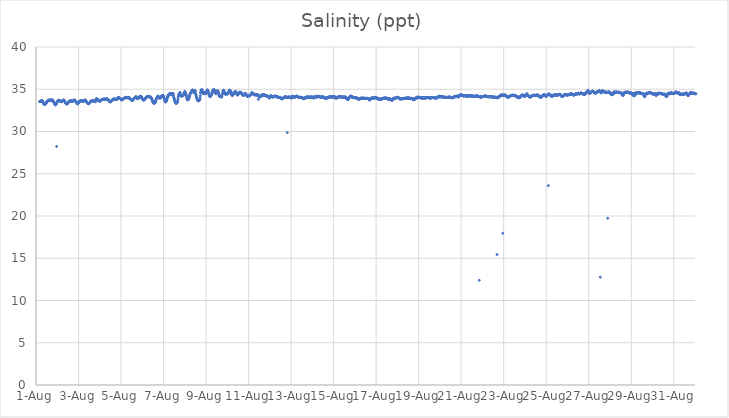
| Category | Salinity (ppt) |
|---|---|
| 44774.166666666664 | 33.56 |
| 44774.177083333336 | 33.54 |
| 44774.1875 | 33.53 |
| 44774.197916666664 | 33.58 |
| 44774.208333333336 | 33.58 |
| 44774.21875 | 33.6 |
| 44774.229166666664 | 33.6 |
| 44774.239583333336 | 33.61 |
| 44774.25 | 33.61 |
| 44774.260416666664 | 33.63 |
| 44774.270833333336 | 33.64 |
| 44774.28125 | 33.62 |
| 44774.291666666664 | 33.61 |
| 44774.302083333336 | 33.6 |
| 44774.3125 | 33.56 |
| 44774.322916666664 | 33.49 |
| 44774.333333333336 | 33.43 |
| 44774.34375 | 33.39 |
| 44774.354166666664 | 33.34 |
| 44774.364583333336 | 33.29 |
| 44774.375 | 33.25 |
| 44774.385416666664 | 33.23 |
| 44774.395833333336 | 33.2 |
| 44774.40625 | 33.2 |
| 44774.416666666664 | 33.21 |
| 44774.427083333336 | 33.26 |
| 44774.4375 | 33.27 |
| 44774.447916666664 | 33.28 |
| 44774.458333333336 | 33.3 |
| 44774.46875 | 33.33 |
| 44774.479166666664 | 33.37 |
| 44774.489583333336 | 33.42 |
| 44774.5 | 33.48 |
| 44774.510416666664 | 33.54 |
| 44774.520833333336 | 33.57 |
| 44774.53125 | 33.59 |
| 44774.541666666664 | 33.59 |
| 44774.552083333336 | 33.6 |
| 44774.5625 | 33.61 |
| 44774.572916666664 | 33.63 |
| 44774.583333333336 | 33.65 |
| 44774.59375 | 33.68 |
| 44774.604166666664 | 33.69 |
| 44774.614583333336 | 33.71 |
| 44774.625 | 33.73 |
| 44774.635416666664 | 33.73 |
| 44774.645833333336 | 33.74 |
| 44774.65625 | 33.72 |
| 44774.666666666664 | 33.71 |
| 44774.677083333336 | 33.64 |
| 44774.6875 | 33.68 |
| 44774.697916666664 | 33.67 |
| 44774.708333333336 | 33.68 |
| 44774.71875 | 33.67 |
| 44774.729166666664 | 33.72 |
| 44774.739583333336 | 33.71 |
| 44774.75 | 33.69 |
| 44774.760416666664 | 33.74 |
| 44774.770833333336 | 33.75 |
| 44774.78125 | 33.69 |
| 44774.791666666664 | 33.6 |
| 44774.802083333336 | 33.63 |
| 44774.8125 | 33.6 |
| 44774.822916666664 | 33.52 |
| 44774.833333333336 | 33.48 |
| 44774.84375 | 33.42 |
| 44774.854166666664 | 33.38 |
| 44774.864583333336 | 33.35 |
| 44774.875 | 33.28 |
| 44774.885416666664 | 33.26 |
| 44774.895833333336 | 33.16 |
| 44774.90625 | 33.16 |
| 44774.916666666664 | 33.18 |
| 44774.927083333336 | 33.24 |
| 44774.9375 | 33.25 |
| 44774.947916666664 | 33.24 |
| 44774.958333333336 | 33.3 |
| 44774.96875 | 28.22 |
| 44774.979166666664 | 33.4 |
| 44774.989583333336 | 33.47 |
| 44775.0 | 33.54 |
| 44775.010416666664 | 33.56 |
| 44775.020833333336 | 33.59 |
| 44775.03125 | 33.61 |
| 44775.041666666664 | 33.66 |
| 44775.052083333336 | 33.69 |
| 44775.0625 | 33.69 |
| 44775.072916666664 | 33.69 |
| 44775.083333333336 | 33.69 |
| 44775.09375 | 33.68 |
| 44775.104166666664 | 33.66 |
| 44775.114583333336 | 33.64 |
| 44775.125 | 33.62 |
| 44775.135416666664 | 33.6 |
| 44775.145833333336 | 33.57 |
| 44775.15625 | 33.56 |
| 44775.166666666664 | 33.56 |
| 44775.177083333336 | 33.55 |
| 44775.1875 | 33.54 |
| 44775.197916666664 | 33.53 |
| 44775.208333333336 | 33.57 |
| 44775.21875 | 33.56 |
| 44775.229166666664 | 33.58 |
| 44775.239583333336 | 33.6 |
| 44775.25 | 33.64 |
| 44775.260416666664 | 33.69 |
| 44775.270833333336 | 33.68 |
| 44775.28125 | 33.7 |
| 44775.291666666664 | 33.73 |
| 44775.302083333336 | 33.74 |
| 44775.3125 | 33.69 |
| 44775.322916666664 | 33.69 |
| 44775.333333333336 | 33.65 |
| 44775.34375 | 33.62 |
| 44775.354166666664 | 33.56 |
| 44775.364583333336 | 33.5 |
| 44775.375 | 33.42 |
| 44775.385416666664 | 33.4 |
| 44775.395833333336 | 33.36 |
| 44775.40625 | 33.33 |
| 44775.416666666664 | 33.29 |
| 44775.427083333336 | 33.27 |
| 44775.4375 | 33.26 |
| 44775.447916666664 | 33.26 |
| 44775.458333333336 | 33.27 |
| 44775.46875 | 33.3 |
| 44775.479166666664 | 33.31 |
| 44775.489583333336 | 33.32 |
| 44775.5 | 33.35 |
| 44775.510416666664 | 33.41 |
| 44775.520833333336 | 33.46 |
| 44775.53125 | 33.52 |
| 44775.541666666664 | 33.54 |
| 44775.552083333336 | 33.56 |
| 44775.5625 | 33.57 |
| 44775.572916666664 | 33.58 |
| 44775.583333333336 | 33.59 |
| 44775.59375 | 33.6 |
| 44775.604166666664 | 33.61 |
| 44775.614583333336 | 33.61 |
| 44775.625 | 33.61 |
| 44775.635416666664 | 33.61 |
| 44775.645833333336 | 33.61 |
| 44775.65625 | 33.61 |
| 44775.666666666664 | 33.6 |
| 44775.677083333336 | 33.6 |
| 44775.6875 | 33.59 |
| 44775.697916666664 | 33.57 |
| 44775.708333333336 | 33.57 |
| 44775.71875 | 33.59 |
| 44775.729166666664 | 33.57 |
| 44775.739583333336 | 33.59 |
| 44775.75 | 33.64 |
| 44775.760416666664 | 33.61 |
| 44775.770833333336 | 33.66 |
| 44775.78125 | 33.69 |
| 44775.791666666664 | 33.69 |
| 44775.802083333336 | 33.7 |
| 44775.8125 | 33.75 |
| 44775.822916666664 | 33.71 |
| 44775.833333333336 | 33.7 |
| 44775.84375 | 33.64 |
| 44775.854166666664 | 33.59 |
| 44775.864583333336 | 33.54 |
| 44775.875 | 33.57 |
| 44775.885416666664 | 33.51 |
| 44775.895833333336 | 33.51 |
| 44775.90625 | 33.43 |
| 44775.916666666664 | 33.46 |
| 44775.927083333336 | 33.29 |
| 44775.9375 | 33.27 |
| 44775.947916666664 | 33.28 |
| 44775.958333333336 | 33.34 |
| 44775.96875 | 33.35 |
| 44775.979166666664 | 33.33 |
| 44775.989583333336 | 33.36 |
| 44776.0 | 33.42 |
| 44776.010416666664 | 33.44 |
| 44776.020833333336 | 33.49 |
| 44776.03125 | 33.52 |
| 44776.041666666664 | 33.55 |
| 44776.052083333336 | 33.57 |
| 44776.0625 | 33.59 |
| 44776.072916666664 | 33.6 |
| 44776.083333333336 | 33.61 |
| 44776.09375 | 33.63 |
| 44776.104166666664 | 33.64 |
| 44776.114583333336 | 33.64 |
| 44776.125 | 33.64 |
| 44776.135416666664 | 33.65 |
| 44776.145833333336 | 33.64 |
| 44776.15625 | 33.63 |
| 44776.166666666664 | 33.62 |
| 44776.177083333336 | 33.62 |
| 44776.1875 | 33.61 |
| 44776.197916666664 | 33.6 |
| 44776.208333333336 | 33.6 |
| 44776.21875 | 33.56 |
| 44776.229166666664 | 33.56 |
| 44776.239583333336 | 33.58 |
| 44776.25 | 33.61 |
| 44776.260416666664 | 33.62 |
| 44776.270833333336 | 33.64 |
| 44776.28125 | 33.7 |
| 44776.291666666664 | 33.68 |
| 44776.302083333336 | 33.68 |
| 44776.3125 | 33.72 |
| 44776.322916666664 | 33.71 |
| 44776.333333333336 | 33.68 |
| 44776.34375 | 33.64 |
| 44776.354166666664 | 33.58 |
| 44776.364583333336 | 33.55 |
| 44776.375 | 33.5 |
| 44776.385416666664 | 33.46 |
| 44776.395833333336 | 33.43 |
| 44776.40625 | 33.4 |
| 44776.416666666664 | 33.38 |
| 44776.427083333336 | 33.34 |
| 44776.4375 | 33.32 |
| 44776.447916666664 | 33.3 |
| 44776.458333333336 | 33.29 |
| 44776.46875 | 33.28 |
| 44776.479166666664 | 33.31 |
| 44776.489583333336 | 33.33 |
| 44776.5 | 33.32 |
| 44776.510416666664 | 33.34 |
| 44776.520833333336 | 33.37 |
| 44776.53125 | 33.4 |
| 44776.541666666664 | 33.45 |
| 44776.552083333336 | 33.51 |
| 44776.5625 | 33.55 |
| 44776.572916666664 | 33.56 |
| 44776.583333333336 | 33.57 |
| 44776.59375 | 33.59 |
| 44776.604166666664 | 33.6 |
| 44776.614583333336 | 33.61 |
| 44776.625 | 33.62 |
| 44776.635416666664 | 33.63 |
| 44776.645833333336 | 33.63 |
| 44776.65625 | 33.64 |
| 44776.666666666664 | 33.64 |
| 44776.677083333336 | 33.63 |
| 44776.6875 | 33.61 |
| 44776.697916666664 | 33.61 |
| 44776.708333333336 | 33.61 |
| 44776.71875 | 33.61 |
| 44776.729166666664 | 33.58 |
| 44776.739583333336 | 33.58 |
| 44776.75 | 33.62 |
| 44776.760416666664 | 33.66 |
| 44776.770833333336 | 33.64 |
| 44776.78125 | 33.67 |
| 44776.791666666664 | 33.6 |
| 44776.802083333336 | 33.52 |
| 44776.8125 | 33.68 |
| 44776.822916666664 | 33.7 |
| 44776.833333333336 | 33.85 |
| 44776.84375 | 33.89 |
| 44776.854166666664 | 33.89 |
| 44776.864583333336 | 33.82 |
| 44776.875 | 33.81 |
| 44776.885416666664 | 33.8 |
| 44776.895833333336 | 33.77 |
| 44776.90625 | 33.78 |
| 44776.916666666664 | 33.75 |
| 44776.927083333336 | 33.74 |
| 44776.9375 | 33.67 |
| 44776.947916666664 | 33.65 |
| 44776.958333333336 | 33.65 |
| 44776.96875 | 33.6 |
| 44776.979166666664 | 33.58 |
| 44776.989583333336 | 33.62 |
| 44777.0 | 33.62 |
| 44777.010416666664 | 33.62 |
| 44777.020833333336 | 33.61 |
| 44777.03125 | 33.63 |
| 44777.041666666664 | 33.67 |
| 44777.052083333336 | 33.7 |
| 44777.0625 | 33.73 |
| 44777.072916666664 | 33.74 |
| 44777.083333333336 | 33.75 |
| 44777.09375 | 33.76 |
| 44777.104166666664 | 33.77 |
| 44777.114583333336 | 33.78 |
| 44777.125 | 33.78 |
| 44777.135416666664 | 33.8 |
| 44777.145833333336 | 33.82 |
| 44777.15625 | 33.82 |
| 44777.166666666664 | 33.82 |
| 44777.177083333336 | 33.81 |
| 44777.1875 | 33.81 |
| 44777.197916666664 | 33.81 |
| 44777.208333333336 | 33.81 |
| 44777.21875 | 33.82 |
| 44777.229166666664 | 33.82 |
| 44777.239583333336 | 33.82 |
| 44777.25 | 33.83 |
| 44777.260416666664 | 33.77 |
| 44777.270833333336 | 33.81 |
| 44777.28125 | 33.82 |
| 44777.291666666664 | 33.82 |
| 44777.302083333336 | 33.84 |
| 44777.3125 | 33.84 |
| 44777.322916666664 | 33.87 |
| 44777.333333333336 | 33.86 |
| 44777.34375 | 33.85 |
| 44777.354166666664 | 33.86 |
| 44777.364583333336 | 33.79 |
| 44777.375 | 33.81 |
| 44777.385416666664 | 33.8 |
| 44777.395833333336 | 33.74 |
| 44777.40625 | 33.71 |
| 44777.416666666664 | 33.68 |
| 44777.427083333336 | 33.66 |
| 44777.4375 | 33.61 |
| 44777.447916666664 | 33.58 |
| 44777.458333333336 | 33.55 |
| 44777.46875 | 33.53 |
| 44777.479166666664 | 33.51 |
| 44777.489583333336 | 33.51 |
| 44777.5 | 33.52 |
| 44777.510416666664 | 33.54 |
| 44777.520833333336 | 33.54 |
| 44777.53125 | 33.55 |
| 44777.541666666664 | 33.58 |
| 44777.552083333336 | 33.61 |
| 44777.5625 | 33.65 |
| 44777.572916666664 | 33.7 |
| 44777.583333333336 | 33.74 |
| 44777.59375 | 33.76 |
| 44777.604166666664 | 33.77 |
| 44777.614583333336 | 33.78 |
| 44777.625 | 33.8 |
| 44777.635416666664 | 33.82 |
| 44777.645833333336 | 33.82 |
| 44777.65625 | 33.85 |
| 44777.666666666664 | 33.85 |
| 44777.677083333336 | 33.85 |
| 44777.6875 | 33.85 |
| 44777.697916666664 | 33.84 |
| 44777.708333333336 | 33.81 |
| 44777.71875 | 33.8 |
| 44777.729166666664 | 33.8 |
| 44777.739583333336 | 33.78 |
| 44777.75 | 33.78 |
| 44777.760416666664 | 33.78 |
| 44777.770833333336 | 33.79 |
| 44777.78125 | 33.77 |
| 44777.791666666664 | 33.79 |
| 44777.802083333336 | 33.83 |
| 44777.8125 | 33.86 |
| 44777.822916666664 | 33.85 |
| 44777.833333333336 | 33.95 |
| 44777.84375 | 33.92 |
| 44777.854166666664 | 33.93 |
| 44777.864583333336 | 34.02 |
| 44777.875 | 33.99 |
| 44777.885416666664 | 34.01 |
| 44777.895833333336 | 34.01 |
| 44777.90625 | 34.01 |
| 44777.916666666664 | 33.98 |
| 44777.927083333336 | 33.99 |
| 44777.9375 | 33.95 |
| 44777.947916666664 | 33.92 |
| 44777.958333333336 | 33.87 |
| 44777.96875 | 33.85 |
| 44777.979166666664 | 33.85 |
| 44777.989583333336 | 33.85 |
| 44778.0 | 33.83 |
| 44778.010416666664 | 33.78 |
| 44778.020833333336 | 33.75 |
| 44778.03125 | 33.74 |
| 44778.041666666664 | 33.76 |
| 44778.052083333336 | 33.8 |
| 44778.0625 | 33.8 |
| 44778.072916666664 | 33.82 |
| 44778.083333333336 | 33.83 |
| 44778.09375 | 33.84 |
| 44778.104166666664 | 33.87 |
| 44778.114583333336 | 33.88 |
| 44778.125 | 33.9 |
| 44778.135416666664 | 33.9 |
| 44778.145833333336 | 33.91 |
| 44778.15625 | 33.92 |
| 44778.166666666664 | 33.94 |
| 44778.177083333336 | 33.97 |
| 44778.1875 | 34 |
| 44778.197916666664 | 34.02 |
| 44778.208333333336 | 34.04 |
| 44778.21875 | 34.03 |
| 44778.229166666664 | 34.04 |
| 44778.239583333336 | 34.04 |
| 44778.25 | 34.01 |
| 44778.260416666664 | 34 |
| 44778.270833333336 | 34 |
| 44778.28125 | 34.01 |
| 44778.291666666664 | 34.02 |
| 44778.302083333336 | 34.01 |
| 44778.3125 | 34 |
| 44778.322916666664 | 34.02 |
| 44778.333333333336 | 34.01 |
| 44778.34375 | 34.01 |
| 44778.354166666664 | 34 |
| 44778.364583333336 | 34.02 |
| 44778.375 | 34 |
| 44778.385416666664 | 33.98 |
| 44778.395833333336 | 33.92 |
| 44778.40625 | 33.89 |
| 44778.416666666664 | 33.89 |
| 44778.427083333336 | 33.86 |
| 44778.4375 | 33.84 |
| 44778.447916666664 | 33.82 |
| 44778.458333333336 | 33.8 |
| 44778.46875 | 33.79 |
| 44778.479166666664 | 33.76 |
| 44778.489583333336 | 33.73 |
| 44778.5 | 33.69 |
| 44778.510416666664 | 33.68 |
| 44778.520833333336 | 33.66 |
| 44778.53125 | 33.67 |
| 44778.541666666664 | 33.7 |
| 44778.552083333336 | 33.72 |
| 44778.5625 | 33.73 |
| 44778.572916666664 | 33.76 |
| 44778.583333333336 | 33.79 |
| 44778.59375 | 33.84 |
| 44778.604166666664 | 33.87 |
| 44778.614583333336 | 33.92 |
| 44778.625 | 33.94 |
| 44778.635416666664 | 33.96 |
| 44778.645833333336 | 33.99 |
| 44778.65625 | 34.01 |
| 44778.666666666664 | 34.04 |
| 44778.677083333336 | 34.07 |
| 44778.6875 | 34.09 |
| 44778.697916666664 | 34.13 |
| 44778.708333333336 | 34.13 |
| 44778.71875 | 34.07 |
| 44778.729166666664 | 34.01 |
| 44778.739583333336 | 33.97 |
| 44778.75 | 33.92 |
| 44778.760416666664 | 33.91 |
| 44778.770833333336 | 33.9 |
| 44778.78125 | 33.91 |
| 44778.791666666664 | 33.9 |
| 44778.802083333336 | 33.92 |
| 44778.8125 | 33.94 |
| 44778.822916666664 | 33.94 |
| 44778.833333333336 | 33.95 |
| 44778.84375 | 34 |
| 44778.854166666664 | 34.01 |
| 44778.864583333336 | 34.1 |
| 44778.875 | 34.17 |
| 44778.885416666664 | 34.14 |
| 44778.895833333336 | 34.04 |
| 44778.90625 | 34.11 |
| 44778.916666666664 | 34.06 |
| 44778.927083333336 | 34.11 |
| 44778.9375 | 34.13 |
| 44778.947916666664 | 34.16 |
| 44778.958333333336 | 34.1 |
| 44778.96875 | 34.04 |
| 44778.979166666664 | 33.99 |
| 44778.989583333336 | 33.94 |
| 44779.0 | 33.87 |
| 44779.010416666664 | 33.83 |
| 44779.020833333336 | 33.79 |
| 44779.03125 | 33.78 |
| 44779.041666666664 | 33.75 |
| 44779.052083333336 | 33.73 |
| 44779.0625 | 33.7 |
| 44779.072916666664 | 33.75 |
| 44779.083333333336 | 33.78 |
| 44779.09375 | 33.75 |
| 44779.104166666664 | 33.78 |
| 44779.114583333336 | 33.79 |
| 44779.125 | 33.83 |
| 44779.135416666664 | 33.89 |
| 44779.145833333336 | 33.95 |
| 44779.15625 | 33.98 |
| 44779.166666666664 | 34 |
| 44779.177083333336 | 34.02 |
| 44779.1875 | 34.04 |
| 44779.197916666664 | 34.06 |
| 44779.208333333336 | 34.08 |
| 44779.21875 | 34.1 |
| 44779.229166666664 | 34.12 |
| 44779.239583333336 | 34.13 |
| 44779.25 | 34.12 |
| 44779.260416666664 | 34.13 |
| 44779.270833333336 | 34.13 |
| 44779.28125 | 34.14 |
| 44779.291666666664 | 34.15 |
| 44779.302083333336 | 34.14 |
| 44779.3125 | 34.13 |
| 44779.322916666664 | 34.07 |
| 44779.333333333336 | 34.1 |
| 44779.34375 | 34.09 |
| 44779.354166666664 | 34.09 |
| 44779.364583333336 | 34.1 |
| 44779.375 | 34.07 |
| 44779.385416666664 | 34.11 |
| 44779.395833333336 | 34.05 |
| 44779.40625 | 34.04 |
| 44779.416666666664 | 33.99 |
| 44779.427083333336 | 33.97 |
| 44779.4375 | 33.9 |
| 44779.447916666664 | 33.83 |
| 44779.458333333336 | 33.77 |
| 44779.46875 | 33.7 |
| 44779.479166666664 | 33.61 |
| 44779.489583333336 | 33.57 |
| 44779.5 | 33.5 |
| 44779.510416666664 | 33.46 |
| 44779.520833333336 | 33.4 |
| 44779.53125 | 33.37 |
| 44779.541666666664 | 33.36 |
| 44779.552083333336 | 33.35 |
| 44779.5625 | 33.35 |
| 44779.572916666664 | 33.38 |
| 44779.583333333336 | 33.41 |
| 44779.59375 | 33.38 |
| 44779.604166666664 | 33.41 |
| 44779.614583333336 | 33.46 |
| 44779.625 | 33.54 |
| 44779.635416666664 | 33.66 |
| 44779.645833333336 | 33.78 |
| 44779.65625 | 33.85 |
| 44779.666666666664 | 33.9 |
| 44779.677083333336 | 33.94 |
| 44779.6875 | 34 |
| 44779.697916666664 | 34.04 |
| 44779.708333333336 | 34.08 |
| 44779.71875 | 34.14 |
| 44779.729166666664 | 34.14 |
| 44779.739583333336 | 34.19 |
| 44779.75 | 34.19 |
| 44779.760416666664 | 34.13 |
| 44779.770833333336 | 34.06 |
| 44779.78125 | 34.02 |
| 44779.791666666664 | 33.99 |
| 44779.802083333336 | 33.97 |
| 44779.8125 | 33.96 |
| 44779.822916666664 | 33.98 |
| 44779.833333333336 | 33.99 |
| 44779.84375 | 33.98 |
| 44779.854166666664 | 33.99 |
| 44779.864583333336 | 33.98 |
| 44779.875 | 34.03 |
| 44779.885416666664 | 34.07 |
| 44779.895833333336 | 34.14 |
| 44779.90625 | 34.16 |
| 44779.916666666664 | 34.21 |
| 44779.927083333336 | 34.24 |
| 44779.9375 | 34.2 |
| 44779.947916666664 | 34.17 |
| 44779.958333333336 | 34.24 |
| 44779.96875 | 34.26 |
| 44779.979166666664 | 34.26 |
| 44779.989583333336 | 34.23 |
| 44780.0 | 34.14 |
| 44780.010416666664 | 34.07 |
| 44780.020833333336 | 34 |
| 44780.03125 | 33.93 |
| 44780.041666666664 | 33.82 |
| 44780.052083333336 | 33.72 |
| 44780.0625 | 33.65 |
| 44780.072916666664 | 33.58 |
| 44780.083333333336 | 33.53 |
| 44780.09375 | 33.5 |
| 44780.104166666664 | 33.5 |
| 44780.114583333336 | 33.58 |
| 44780.125 | 33.6 |
| 44780.135416666664 | 33.6 |
| 44780.145833333336 | 33.67 |
| 44780.15625 | 33.76 |
| 44780.166666666664 | 33.9 |
| 44780.177083333336 | 33.98 |
| 44780.1875 | 34.07 |
| 44780.197916666664 | 34.14 |
| 44780.208333333336 | 34.19 |
| 44780.21875 | 34.23 |
| 44780.229166666664 | 34.27 |
| 44780.239583333336 | 34.32 |
| 44780.25 | 34.37 |
| 44780.260416666664 | 34.41 |
| 44780.270833333336 | 34.45 |
| 44780.28125 | 34.46 |
| 44780.291666666664 | 34.48 |
| 44780.302083333336 | 34.51 |
| 44780.3125 | 34.52 |
| 44780.322916666664 | 34.49 |
| 44780.333333333336 | 34.5 |
| 44780.34375 | 34.47 |
| 44780.354166666664 | 34.43 |
| 44780.364583333336 | 34.39 |
| 44780.375 | 34.37 |
| 44780.385416666664 | 34.35 |
| 44780.395833333336 | 34.35 |
| 44780.40625 | 34.46 |
| 44780.416666666664 | 34.45 |
| 44780.427083333336 | 34.39 |
| 44780.4375 | 34.44 |
| 44780.447916666664 | 34.48 |
| 44780.458333333336 | 34.47 |
| 44780.46875 | 34.23 |
| 44780.479166666664 | 34.06 |
| 44780.489583333336 | 33.98 |
| 44780.5 | 33.88 |
| 44780.510416666664 | 33.78 |
| 44780.520833333336 | 33.72 |
| 44780.53125 | 33.6 |
| 44780.541666666664 | 33.54 |
| 44780.552083333336 | 33.44 |
| 44780.5625 | 33.38 |
| 44780.572916666664 | 33.35 |
| 44780.583333333336 | 33.35 |
| 44780.59375 | 33.36 |
| 44780.604166666664 | 33.36 |
| 44780.614583333336 | 33.36 |
| 44780.625 | 33.43 |
| 44780.635416666664 | 33.39 |
| 44780.645833333336 | 33.43 |
| 44780.65625 | 33.51 |
| 44780.666666666664 | 33.64 |
| 44780.677083333336 | 33.84 |
| 44780.6875 | 34.07 |
| 44780.697916666664 | 34.19 |
| 44780.708333333336 | 34.3 |
| 44780.71875 | 34.36 |
| 44780.729166666664 | 34.44 |
| 44780.739583333336 | 34.53 |
| 44780.75 | 34.54 |
| 44780.760416666664 | 34.56 |
| 44780.770833333336 | 34.6 |
| 44780.78125 | 34.59 |
| 44780.791666666664 | 34.43 |
| 44780.802083333336 | 34.33 |
| 44780.8125 | 34.27 |
| 44780.822916666664 | 34.24 |
| 44780.833333333336 | 34.19 |
| 44780.84375 | 34.19 |
| 44780.854166666664 | 34.19 |
| 44780.864583333336 | 34.22 |
| 44780.875 | 34.24 |
| 44780.885416666664 | 34.25 |
| 44780.895833333336 | 34.26 |
| 44780.90625 | 34.24 |
| 44780.916666666664 | 34.23 |
| 44780.927083333336 | 34.28 |
| 44780.9375 | 34.31 |
| 44780.947916666664 | 34.36 |
| 44780.958333333336 | 34.49 |
| 44780.96875 | 34.56 |
| 44780.979166666664 | 34.63 |
| 44780.989583333336 | 34.68 |
| 44781.0 | 34.74 |
| 44781.010416666664 | 34.68 |
| 44781.020833333336 | 34.63 |
| 44781.03125 | 34.58 |
| 44781.041666666664 | 34.5 |
| 44781.052083333336 | 34.4 |
| 44781.0625 | 34.33 |
| 44781.072916666664 | 34.26 |
| 44781.083333333336 | 34.09 |
| 44781.09375 | 33.98 |
| 44781.104166666664 | 33.88 |
| 44781.114583333336 | 33.82 |
| 44781.125 | 33.77 |
| 44781.135416666664 | 33.74 |
| 44781.145833333336 | 33.74 |
| 44781.15625 | 33.78 |
| 44781.166666666664 | 33.85 |
| 44781.177083333336 | 33.83 |
| 44781.1875 | 33.87 |
| 44781.197916666664 | 33.96 |
| 44781.208333333336 | 34.07 |
| 44781.21875 | 34.17 |
| 44781.229166666664 | 34.28 |
| 44781.239583333336 | 34.39 |
| 44781.25 | 34.46 |
| 44781.260416666664 | 34.51 |
| 44781.270833333336 | 34.54 |
| 44781.28125 | 34.59 |
| 44781.291666666664 | 34.63 |
| 44781.302083333336 | 34.67 |
| 44781.3125 | 34.72 |
| 44781.322916666664 | 34.75 |
| 44781.333333333336 | 34.81 |
| 44781.34375 | 34.88 |
| 44781.354166666664 | 34.92 |
| 44781.364583333336 | 34.9 |
| 44781.375 | 34.83 |
| 44781.385416666664 | 34.82 |
| 44781.395833333336 | 34.73 |
| 44781.40625 | 34.61 |
| 44781.416666666664 | 34.69 |
| 44781.427083333336 | 34.63 |
| 44781.4375 | 34.71 |
| 44781.447916666664 | 34.76 |
| 44781.458333333336 | 34.81 |
| 44781.46875 | 34.79 |
| 44781.479166666664 | 34.71 |
| 44781.489583333336 | 34.85 |
| 44781.5 | 34.71 |
| 44781.510416666664 | 34.46 |
| 44781.520833333336 | 34.34 |
| 44781.53125 | 34.29 |
| 44781.541666666664 | 34.13 |
| 44781.55210648148 | 34.03 |
| 44781.5625 | 33.94 |
| 44781.572916666664 | 33.87 |
| 44781.583333333336 | 33.81 |
| 44781.59375 | 33.75 |
| 44781.604166666664 | 33.69 |
| 44781.614583333336 | 33.64 |
| 44781.625 | 33.64 |
| 44781.635416666664 | 33.64 |
| 44781.645833333336 | 33.63 |
| 44781.65625 | 33.66 |
| 44781.666666666664 | 33.68 |
| 44781.677083333336 | 33.71 |
| 44781.6875 | 33.69 |
| 44781.697916666664 | 33.75 |
| 44781.708333333336 | 33.81 |
| 44781.71875 | 34 |
| 44781.729166666664 | 34.23 |
| 44781.739583333336 | 34.56 |
| 44781.75 | 34.66 |
| 44781.760416666664 | 34.78 |
| 44781.770833333336 | 34.87 |
| 44781.78125 | 34.92 |
| 44781.791666666664 | 34.97 |
| 44781.802083333336 | 34.95 |
| 44781.8125 | 34.89 |
| 44781.822916666664 | 34.83 |
| 44781.833333333336 | 34.68 |
| 44781.84375 | 34.53 |
| 44781.854166666664 | 34.47 |
| 44781.864583333336 | 34.49 |
| 44781.875 | 34.5 |
| 44781.885416666664 | 34.55 |
| 44781.895833333336 | 34.58 |
| 44781.90625 | 34.61 |
| 44781.916666666664 | 34.61 |
| 44781.927083333336 | 34.6 |
| 44781.9375 | 34.59 |
| 44781.947916666664 | 34.55 |
| 44781.958333333336 | 34.53 |
| 44781.96875 | 34.5 |
| 44781.979166666664 | 34.47 |
| 44781.989583333336 | 34.52 |
| 44782.0 | 34.59 |
| 44782.010416666664 | 34.6 |
| 44782.020833333336 | 34.69 |
| 44782.03125 | 34.81 |
| 44782.041666666664 | 34.75 |
| 44782.052083333336 | 34.83 |
| 44782.0625 | 34.93 |
| 44782.072916666664 | 34.88 |
| 44782.083333333336 | 34.85 |
| 44782.09375 | 34.77 |
| 44782.104166666664 | 34.7 |
| 44782.114583333336 | 34.57 |
| 44782.125 | 34.47 |
| 44782.135416666664 | 34.39 |
| 44782.145833333336 | 34.32 |
| 44782.15625 | 34.25 |
| 44782.166666666664 | 34.2 |
| 44782.177083333336 | 34.15 |
| 44782.1875 | 34.13 |
| 44782.197916666664 | 34.13 |
| 44782.208333333336 | 34.18 |
| 44782.21875 | 34.25 |
| 44782.229166666664 | 34.22 |
| 44782.239583333336 | 34.28 |
| 44782.25 | 34.32 |
| 44782.260416666664 | 34.41 |
| 44782.270833333336 | 34.5 |
| 44782.28125 | 34.58 |
| 44782.291666666664 | 34.69 |
| 44782.302083333336 | 34.75 |
| 44782.3125 | 34.79 |
| 44782.322916666664 | 34.82 |
| 44782.333333333336 | 34.92 |
| 44782.34375 | 34.95 |
| 44782.354166666664 | 34.95 |
| 44782.364583333336 | 34.96 |
| 44782.375 | 34.95 |
| 44782.385416666664 | 34.9 |
| 44782.395833333336 | 34.81 |
| 44782.40625 | 34.73 |
| 44782.416666666664 | 34.63 |
| 44782.427083333336 | 34.53 |
| 44782.4375 | 34.53 |
| 44782.447916666664 | 34.52 |
| 44782.458333333336 | 34.48 |
| 44782.46875 | 34.55 |
| 44782.479166666664 | 34.5 |
| 44782.489583333336 | 34.55 |
| 44782.5 | 34.58 |
| 44782.510416666664 | 34.67 |
| 44782.520833333336 | 34.74 |
| 44782.53125 | 34.82 |
| 44782.541666666664 | 34.85 |
| 44782.552083333336 | 34.82 |
| 44782.5625 | 34.75 |
| 44782.572916666664 | 34.65 |
| 44782.583333333336 | 34.5 |
| 44782.59375 | 34.49 |
| 44782.604166666664 | 34.28 |
| 44782.614583333336 | 34.23 |
| 44782.625 | 34.16 |
| 44782.635416666664 | 34.17 |
| 44782.645833333336 | 34.23 |
| 44782.65625 | 34.18 |
| 44782.666666666664 | 34.11 |
| 44782.677083333336 | 34.16 |
| 44782.6875 | 34.13 |
| 44782.697916666664 | 34.11 |
| 44782.708333333336 | 34.19 |
| 44782.71875 | 34.11 |
| 44782.729166666664 | 34.08 |
| 44782.739583333336 | 34.11 |
| 44782.75 | 34.21 |
| 44782.760416666664 | 34.38 |
| 44782.770833333336 | 34.44 |
| 44782.78125 | 34.56 |
| 44782.791666666664 | 34.71 |
| 44782.802083333336 | 34.83 |
| 44782.8125 | 34.89 |
| 44782.822916666664 | 34.86 |
| 44782.833333333336 | 34.84 |
| 44782.84375 | 34.79 |
| 44782.854166666664 | 34.73 |
| 44782.864583333336 | 34.66 |
| 44782.875 | 34.57 |
| 44782.885416666664 | 34.49 |
| 44782.895833333336 | 34.45 |
| 44782.90625 | 34.41 |
| 44782.916666666664 | 34.41 |
| 44782.927083333336 | 34.45 |
| 44782.9375 | 34.46 |
| 44782.947916666664 | 34.48 |
| 44782.958333333336 | 34.48 |
| 44782.96875 | 34.46 |
| 44782.979166666664 | 34.45 |
| 44782.989583333336 | 34.43 |
| 44783.0 | 34.44 |
| 44783.010416666664 | 34.47 |
| 44783.020833333336 | 34.49 |
| 44783.03125 | 34.5 |
| 44783.041666666664 | 34.5 |
| 44783.052083333336 | 34.6 |
| 44783.0625 | 34.59 |
| 44783.072916666664 | 34.77 |
| 44783.083333333336 | 34.82 |
| 44783.09375 | 34.87 |
| 44783.104166666664 | 34.84 |
| 44783.114583333336 | 34.89 |
| 44783.125 | 34.86 |
| 44783.135416666664 | 34.81 |
| 44783.145833333336 | 34.81 |
| 44783.15625 | 34.75 |
| 44783.166666666664 | 34.69 |
| 44783.177083333336 | 34.59 |
| 44783.1875 | 34.52 |
| 44783.197916666664 | 34.42 |
| 44783.208333333336 | 34.39 |
| 44783.21875 | 34.3 |
| 44783.229166666664 | 34.27 |
| 44783.239583333336 | 34.27 |
| 44783.25 | 34.3 |
| 44783.260416666664 | 34.36 |
| 44783.270833333336 | 34.34 |
| 44783.28125 | 34.39 |
| 44783.291666666664 | 34.45 |
| 44783.302083333336 | 34.54 |
| 44783.3125 | 34.54 |
| 44783.322916666664 | 34.56 |
| 44783.333333333336 | 34.6 |
| 44783.34375 | 34.65 |
| 44783.354166666664 | 34.66 |
| 44783.364583333336 | 34.69 |
| 44783.375 | 34.71 |
| 44783.385416666664 | 34.71 |
| 44783.395833333336 | 34.71 |
| 44783.40625 | 34.69 |
| 44783.416666666664 | 34.61 |
| 44783.427083333336 | 34.55 |
| 44783.4375 | 34.45 |
| 44783.447916666664 | 34.42 |
| 44783.458333333336 | 34.36 |
| 44783.46875 | 34.33 |
| 44783.479166666664 | 34.33 |
| 44783.489583333336 | 34.33 |
| 44783.5 | 34.44 |
| 44783.510416666664 | 34.38 |
| 44783.520833333336 | 34.44 |
| 44783.53125 | 34.48 |
| 44783.541666666664 | 34.52 |
| 44783.552083333336 | 34.59 |
| 44783.5625 | 34.58 |
| 44783.572916666664 | 34.64 |
| 44783.583333333336 | 34.63 |
| 44783.59375 | 34.64 |
| 44783.604166666664 | 34.61 |
| 44783.614583333336 | 34.64 |
| 44783.625 | 34.62 |
| 44783.635416666664 | 34.63 |
| 44783.645833333336 | 34.58 |
| 44783.65625 | 34.56 |
| 44783.666666666664 | 34.56 |
| 44783.677083333336 | 34.47 |
| 44783.6875 | 34.44 |
| 44783.697916666664 | 34.44 |
| 44783.708333333336 | 34.4 |
| 44783.71875 | 34.37 |
| 44783.729166666664 | 34.33 |
| 44783.739583333336 | 34.27 |
| 44783.75 | 34.31 |
| 44783.760416666664 | 34.33 |
| 44783.770833333336 | 34.29 |
| 44783.78125 | 34.29 |
| 44783.791666666664 | 34.35 |
| 44783.802083333336 | 34.4 |
| 44783.8125 | 34.43 |
| 44783.822916666664 | 34.48 |
| 44783.833333333336 | 34.5 |
| 44783.84375 | 34.52 |
| 44783.854166666664 | 34.5 |
| 44783.864583333336 | 34.45 |
| 44783.875 | 34.42 |
| 44783.885416666664 | 34.41 |
| 44783.895833333336 | 34.34 |
| 44783.90625 | 34.31 |
| 44783.916666666664 | 34.24 |
| 44783.927083333336 | 34.21 |
| 44783.9375 | 34.16 |
| 44783.947916666664 | 34.15 |
| 44783.958333333336 | 34.16 |
| 44783.96875 | 34.23 |
| 44783.979166666664 | 34.26 |
| 44783.989583333336 | 34.25 |
| 44784.0 | 34.24 |
| 44784.010416666664 | 34.24 |
| 44784.020833333336 | 34.22 |
| 44784.03125 | 34.25 |
| 44784.041666666664 | 34.25 |
| 44784.052083333336 | 34.21 |
| 44784.0625 | 34.24 |
| 44784.072916666664 | 34.26 |
| 44784.083333333336 | 34.29 |
| 44784.09375 | 34.32 |
| 44784.104166666664 | 34.36 |
| 44784.114583333336 | 34.4 |
| 44784.125 | 34.47 |
| 44784.135416666664 | 34.46 |
| 44784.145833333336 | 34.57 |
| 44784.15625 | 34.6 |
| 44784.166666666664 | 34.6 |
| 44784.177083333336 | 34.51 |
| 44784.1875 | 34.44 |
| 44784.197916666664 | 34.52 |
| 44784.208333333336 | 34.49 |
| 44784.21875 | 34.5 |
| 44784.229166666664 | 34.4 |
| 44784.239583333336 | 34.43 |
| 44784.25 | 34.39 |
| 44784.260416666664 | 34.38 |
| 44784.270833333336 | 34.33 |
| 44784.28125 | 34.34 |
| 44784.291666666664 | 34.33 |
| 44784.302083333336 | 34.34 |
| 44784.3125 | 34.34 |
| 44784.322916666664 | 34.35 |
| 44784.333333333336 | 34.38 |
| 44784.34375 | 34.38 |
| 44784.354166666664 | 34.35 |
| 44784.364583333336 | 34.36 |
| 44784.375 | 34.35 |
| 44784.385416666664 | 34.33 |
| 44784.395833333336 | 34.31 |
| 44784.40625 | 34.29 |
| 44784.416666666664 | 34.31 |
| 44784.427083333336 | 34.33 |
| 44784.4375 | 34.34 |
| 44784.447916666664 | 34.31 |
| 44784.458333333336 | 33.8 |
| 44784.46875 | 34.23 |
| 44784.479166666664 | 34.19 |
| 44784.489583333336 | 34.15 |
| 44784.5 | 34.13 |
| 44784.510416666664 | 34.1 |
| 44784.520833333336 | 34.09 |
| 44784.53125 | 34.09 |
| 44784.541666666664 | 34.09 |
| 44784.552083333336 | 34.18 |
| 44784.5625 | 34.14 |
| 44784.572916666664 | 34.14 |
| 44784.583333333336 | 34.18 |
| 44784.59375 | 34.21 |
| 44784.604166666664 | 34.3 |
| 44784.614583333336 | 34.29 |
| 44784.625 | 34.3 |
| 44784.635416666664 | 34.31 |
| 44784.645833333336 | 34.32 |
| 44784.65625 | 34.35 |
| 44784.666666666664 | 34.32 |
| 44784.677083333336 | 34.32 |
| 44784.6875 | 34.34 |
| 44784.697916666664 | 34.35 |
| 44784.708333333336 | 34.24 |
| 44784.71875 | 34.36 |
| 44784.729166666664 | 34.33 |
| 44784.739583333336 | 34.34 |
| 44784.75 | 34.3 |
| 44784.760416666664 | 34.32 |
| 44784.770833333336 | 34.3 |
| 44784.78125 | 34.28 |
| 44784.791666666664 | 34.27 |
| 44784.802083333336 | 34.25 |
| 44784.8125 | 34.22 |
| 44784.822916666664 | 34.23 |
| 44784.833333333336 | 34.23 |
| 44784.84375 | 34.22 |
| 44784.854166666664 | 34.21 |
| 44784.864583333336 | 34.2 |
| 44784.875 | 34.19 |
| 44784.885416666664 | 34.18 |
| 44784.895833333336 | 34.14 |
| 44784.90625 | 34.14 |
| 44784.916666666664 | 34.13 |
| 44784.927083333336 | 34.15 |
| 44784.9375 | 34.11 |
| 44784.947916666664 | 34.05 |
| 44784.958333333336 | 34 |
| 44784.96875 | 33.97 |
| 44784.979166666664 | 33.96 |
| 44784.989583333336 | 34.01 |
| 44785.0 | 34.08 |
| 44785.010416666664 | 34.18 |
| 44785.020833333336 | 34.2 |
| 44785.03125 | 34.22 |
| 44785.041666666664 | 34.22 |
| 44785.052083333336 | 34.21 |
| 44785.0625 | 34.19 |
| 44785.072916666664 | 34.18 |
| 44785.083333333336 | 34.17 |
| 44785.09375 | 34.11 |
| 44785.104166666664 | 34.11 |
| 44785.114583333336 | 34.11 |
| 44785.125 | 34.12 |
| 44785.135416666664 | 34.11 |
| 44785.145833333336 | 34.1 |
| 44785.15625 | 34.09 |
| 44785.166666666664 | 34.1 |
| 44785.177083333336 | 34.11 |
| 44785.1875 | 34.12 |
| 44785.197916666664 | 34.15 |
| 44785.208333333336 | 34.16 |
| 44785.21875 | 34.17 |
| 44785.229166666664 | 34.17 |
| 44785.239583333336 | 34.16 |
| 44785.25 | 34.16 |
| 44785.260416666664 | 34.17 |
| 44785.270833333336 | 34.17 |
| 44785.28125 | 34.2 |
| 44785.291666666664 | 34.14 |
| 44785.302083333336 | 34.13 |
| 44785.3125 | 34.12 |
| 44785.322916666664 | 34.11 |
| 44785.333333333336 | 34.1 |
| 44785.34375 | 34.09 |
| 44785.354166666664 | 34.09 |
| 44785.364583333336 | 34.1 |
| 44785.375 | 34.1 |
| 44785.385416666664 | 34.09 |
| 44785.395833333336 | 34.05 |
| 44785.40625 | 34.04 |
| 44785.416666666664 | 34.03 |
| 44785.427083333336 | 34.03 |
| 44785.4375 | 34.03 |
| 44785.447916666664 | 34.02 |
| 44785.458333333336 | 34.01 |
| 44785.46875 | 34.02 |
| 44785.479166666664 | 34.02 |
| 44785.489583333336 | 34.02 |
| 44785.5 | 34 |
| 44785.510416666664 | 33.97 |
| 44785.520833333336 | 33.95 |
| 44785.53125 | 33.92 |
| 44785.541666666664 | 33.89 |
| 44785.552083333336 | 33.89 |
| 44785.5625 | 33.88 |
| 44785.572916666664 | 33.85 |
| 44785.583333333336 | 33.88 |
| 44785.59375 | 33.93 |
| 44785.604166666664 | 33.93 |
| 44785.614583333336 | 33.93 |
| 44785.625 | 33.94 |
| 44785.635416666664 | 33.96 |
| 44785.645833333336 | 33.99 |
| 44785.65625 | 33.99 |
| 44785.666666666664 | 34 |
| 44785.677083333336 | 34.05 |
| 44785.6875 | 34.07 |
| 44785.697916666664 | 34.07 |
| 44785.708333333336 | 34.09 |
| 44785.71875 | 34.11 |
| 44785.729166666664 | 34.11 |
| 44785.739583333336 | 34.12 |
| 44785.75 | 34.09 |
| 44785.760416666664 | 34.09 |
| 44785.770833333336 | 34.04 |
| 44785.78125 | 34.07 |
| 44785.791666666664 | 34.03 |
| 44785.802083333336 | 34.05 |
| 44785.8125 | 34.06 |
| 44785.822916666664 | 29.87 |
| 44785.833333333336 | 34.04 |
| 44785.84375 | 34.03 |
| 44785.854166666664 | 34.03 |
| 44785.864583333336 | 34.04 |
| 44785.875 | 34.06 |
| 44785.885416666664 | 34.06 |
| 44785.895833333336 | 34.06 |
| 44785.90625 | 34.07 |
| 44785.916666666664 | 34.07 |
| 44785.927083333336 | 34.07 |
| 44785.9375 | 34.06 |
| 44785.947916666664 | 34.04 |
| 44785.958333333336 | 34.04 |
| 44785.96875 | 34.04 |
| 44785.979166666664 | 34.05 |
| 44785.989583333336 | 34.04 |
| 44786.0 | 34.02 |
| 44786.010416666664 | 33.98 |
| 44786.020833333336 | 33.95 |
| 44786.03125 | 33.98 |
| 44786.041666666664 | 34.05 |
| 44786.052083333336 | 34.12 |
| 44786.0625 | 34.15 |
| 44786.072916666664 | 34.17 |
| 44786.083333333336 | 34.16 |
| 44786.09375 | 34.14 |
| 44786.104166666664 | 34.11 |
| 44786.114583333336 | 34.11 |
| 44786.125 | 34.08 |
| 44786.135416666664 | 34.1 |
| 44786.145833333336 | 34.09 |
| 44786.15625 | 34.07 |
| 44786.166666666664 | 34.05 |
| 44786.177083333336 | 34.05 |
| 44786.1875 | 34.08 |
| 44786.197916666664 | 34.09 |
| 44786.208333333336 | 34.12 |
| 44786.21875 | 34.14 |
| 44786.229166666664 | 34.16 |
| 44786.239583333336 | 34.16 |
| 44786.25 | 34.18 |
| 44786.260416666664 | 34.19 |
| 44786.270833333336 | 34.17 |
| 44786.28125 | 34.14 |
| 44786.291666666664 | 34.13 |
| 44786.302083333336 | 34.12 |
| 44786.3125 | 34.12 |
| 44786.322916666664 | 34.1 |
| 44786.333333333336 | 34.09 |
| 44786.34375 | 34.08 |
| 44786.354166666664 | 34.05 |
| 44786.364583333336 | 34.03 |
| 44786.375 | 34.05 |
| 44786.385416666664 | 34.02 |
| 44786.395833333336 | 34.02 |
| 44786.40625 | 34.03 |
| 44786.416666666664 | 34.04 |
| 44786.427083333336 | 34.05 |
| 44786.4375 | 34.04 |
| 44786.447916666664 | 34.03 |
| 44786.458333333336 | 34.03 |
| 44786.46875 | 34.03 |
| 44786.479166666664 | 34.02 |
| 44786.489583333336 | 34.02 |
| 44786.5 | 34.03 |
| 44786.510416666664 | 34.03 |
| 44786.520833333336 | 34.01 |
| 44786.53125 | 34 |
| 44786.541666666664 | 33.97 |
| 44786.552083333336 | 33.95 |
| 44786.5625 | 33.92 |
| 44786.572916666664 | 33.91 |
| 44786.583333333336 | 33.89 |
| 44786.59375 | 33.89 |
| 44786.604166666664 | 33.9 |
| 44786.614583333336 | 33.94 |
| 44786.625 | 34 |
| 44786.635416666664 | 33.92 |
| 44786.645833333336 | 33.95 |
| 44786.65625 | 34.01 |
| 44786.666666666664 | 34 |
| 44786.677083333336 | 34 |
| 44786.6875 | 34.02 |
| 44786.697916666664 | 33.95 |
| 44786.708333333336 | 34.05 |
| 44786.71875 | 34.06 |
| 44786.729166666664 | 34.07 |
| 44786.739583333336 | 34.07 |
| 44786.75 | 34.04 |
| 44786.760416666664 | 34.03 |
| 44786.770833333336 | 34.08 |
| 44786.78125 | 34.07 |
| 44786.791666666664 | 34.1 |
| 44786.802083333336 | 34.07 |
| 44786.8125 | 34.08 |
| 44786.822916666664 | 34.06 |
| 44786.833333333336 | 34.09 |
| 44786.84375 | 34.06 |
| 44786.854166666664 | 34.06 |
| 44786.864583333336 | 34.06 |
| 44786.875 | 34.05 |
| 44786.885416666664 | 34.03 |
| 44786.895833333336 | 34.03 |
| 44786.90625 | 34.04 |
| 44786.916666666664 | 34.06 |
| 44786.927083333336 | 34.06 |
| 44786.9375 | 34.08 |
| 44786.947916666664 | 34.08 |
| 44786.958333333336 | 34.08 |
| 44786.96875 | 34.08 |
| 44786.979166666664 | 34.07 |
| 44786.989583333336 | 34.06 |
| 44787.0 | 34.07 |
| 44787.010416666664 | 34.07 |
| 44787.020833333336 | 34.06 |
| 44787.03125 | 34.04 |
| 44787.041666666664 | 34 |
| 44787.052083333336 | 33.98 |
| 44787.0625 | 33.97 |
| 44787.072916666664 | 33.97 |
| 44787.083333333336 | 34.01 |
| 44787.09375 | 34.07 |
| 44787.104166666664 | 34.12 |
| 44787.114583333336 | 34.16 |
| 44787.125 | 34.16 |
| 44787.135416666664 | 34.17 |
| 44787.145833333336 | 34.12 |
| 44787.15625 | 34.11 |
| 44787.166666666664 | 34.08 |
| 44787.177083333336 | 34.07 |
| 44787.1875 | 34.05 |
| 44787.197916666664 | 34.06 |
| 44787.208333333336 | 34.08 |
| 44787.21875 | 34.09 |
| 44787.229166666664 | 34.12 |
| 44787.239583333336 | 34.16 |
| 44787.25 | 34.17 |
| 44787.260416666664 | 34.14 |
| 44787.270833333336 | 34.16 |
| 44787.28125 | 34.15 |
| 44787.291666666664 | 34.13 |
| 44787.302083333336 | 34.13 |
| 44787.3125 | 34.15 |
| 44787.322916666664 | 34.14 |
| 44787.333333333336 | 34.15 |
| 44787.34375 | 34.12 |
| 44787.354166666664 | 34.1 |
| 44787.364583333336 | 34.09 |
| 44787.375 | 34.06 |
| 44787.385416666664 | 34.05 |
| 44787.395833333336 | 34.03 |
| 44787.40625 | 34.06 |
| 44787.416666666664 | 34.04 |
| 44787.427083333336 | 34.05 |
| 44787.4375 | 34.06 |
| 44787.447916666664 | 34.09 |
| 44787.458333333336 | 34.07 |
| 44787.46875 | 34.08 |
| 44787.479166666664 | 34.08 |
| 44787.489583333336 | 34.08 |
| 44787.5 | 34.07 |
| 44787.510416666664 | 34.05 |
| 44787.520833333336 | 34.06 |
| 44787.53125 | 34.07 |
| 44787.541666666664 | 34.06 |
| 44787.552083333336 | 34.04 |
| 44787.5625 | 34.03 |
| 44787.572916666664 | 34.01 |
| 44787.583333333336 | 33.97 |
| 44787.59375 | 33.93 |
| 44787.604166666664 | 33.91 |
| 44787.614583333336 | 33.91 |
| 44787.625 | 33.91 |
| 44787.635416666664 | 33.91 |
| 44787.645833333336 | 33.92 |
| 44787.65625 | 34.03 |
| 44787.666666666664 | 33.97 |
| 44787.677083333336 | 33.98 |
| 44787.6875 | 33.99 |
| 44787.697916666664 | 33.95 |
| 44787.708333333336 | 34.02 |
| 44787.71875 | 34.01 |
| 44787.729166666664 | 34.01 |
| 44787.739583333336 | 34.01 |
| 44787.75 | 34.08 |
| 44787.760416666664 | 34.02 |
| 44787.770833333336 | 34.02 |
| 44787.78125 | 34.07 |
| 44787.791666666664 | 34.05 |
| 44787.802083333336 | 34.06 |
| 44787.8125 | 34.11 |
| 44787.822916666664 | 34.09 |
| 44787.833333333336 | 34.1 |
| 44787.84375 | 34.09 |
| 44787.854166666664 | 34.1 |
| 44787.864583333336 | 34.12 |
| 44787.875 | 34.12 |
| 44787.885416666664 | 34.1 |
| 44787.895833333336 | 34.1 |
| 44787.90625 | 34.1 |
| 44787.916666666664 | 34.07 |
| 44787.927083333336 | 34.07 |
| 44787.9375 | 34.08 |
| 44787.947916666664 | 34.09 |
| 44787.958333333336 | 34.09 |
| 44787.96875 | 34.09 |
| 44787.979166666664 | 34.09 |
| 44787.989583333336 | 34.09 |
| 44788.0 | 34.07 |
| 44788.010416666664 | 34.08 |
| 44788.020833333336 | 34.08 |
| 44788.03125 | 34.08 |
| 44788.041666666664 | 34.1 |
| 44788.052083333336 | 34.1 |
| 44788.0625 | 34.09 |
| 44788.072916666664 | 34.06 |
| 44788.083333333336 | 34.04 |
| 44788.09375 | 33.98 |
| 44788.104166666664 | 33.94 |
| 44788.114583333336 | 33.92 |
| 44788.125 | 33.93 |
| 44788.135416666664 | 33.95 |
| 44788.145833333336 | 33.99 |
| 44788.15625 | 34.03 |
| 44788.166666666664 | 34.08 |
| 44788.177083333336 | 34.04 |
| 44788.1875 | 34.03 |
| 44788.197916666664 | 34.02 |
| 44788.208333333336 | 34.03 |
| 44788.21875 | 34.04 |
| 44788.229166666664 | 34.04 |
| 44788.239583333336 | 34.08 |
| 44788.25 | 34.09 |
| 44788.260416666664 | 34.12 |
| 44788.270833333336 | 34.15 |
| 44788.28125 | 34.14 |
| 44788.291666666664 | 34.1 |
| 44788.302083333336 | 34.1 |
| 44788.3125 | 34.08 |
| 44788.322916666664 | 34.09 |
| 44788.333333333336 | 34.12 |
| 44788.34375 | 34.11 |
| 44788.354166666664 | 34.13 |
| 44788.364583333336 | 34.13 |
| 44788.375 | 34.07 |
| 44788.385416666664 | 34.1 |
| 44788.395833333336 | 34.08 |
| 44788.40625 | 34.08 |
| 44788.416666666664 | 34.06 |
| 44788.427083333336 | 34.07 |
| 44788.4375 | 34.07 |
| 44788.447916666664 | 34.06 |
| 44788.458333333336 | 34.06 |
| 44788.46875 | 34.06 |
| 44788.479166666664 | 34.08 |
| 44788.489583333336 | 34.08 |
| 44788.5 | 34.07 |
| 44788.510416666664 | 34.07 |
| 44788.520833333336 | 34.06 |
| 44788.53125 | 34.05 |
| 44788.541666666664 | 34.04 |
| 44788.552083333336 | 34.05 |
| 44788.5625 | 34.06 |
| 44788.572916666664 | 34.07 |
| 44788.583333333336 | 34.05 |
| 44788.59375 | 34 |
| 44788.604166666664 | 33.95 |
| 44788.614583333336 | 33.9 |
| 44788.625 | 33.86 |
| 44788.635416666664 | 33.81 |
| 44788.645833333336 | 33.8 |
| 44788.65625 | 33.79 |
| 44788.666666666664 | 33.8 |
| 44788.677083333336 | 33.84 |
| 44788.6875 | 33.84 |
| 44788.697916666664 | 33.82 |
| 44788.708333333336 | 33.89 |
| 44788.71875 | 33.97 |
| 44788.729166666664 | 34 |
| 44788.739583333336 | 34.03 |
| 44788.75 | 34.06 |
| 44788.760416666664 | 34.08 |
| 44788.770833333336 | 34.14 |
| 44788.78125 | 34.14 |
| 44788.791666666664 | 34.17 |
| 44788.802083333336 | 34.18 |
| 44788.8125 | 34.2 |
| 44788.822916666664 | 34.16 |
| 44788.833333333336 | 34.15 |
| 44788.84375 | 34.12 |
| 44788.854166666664 | 34.13 |
| 44788.864583333336 | 34.1 |
| 44788.875 | 34.1 |
| 44788.885416666664 | 34.01 |
| 44788.895833333336 | 34.07 |
| 44788.90625 | 34.04 |
| 44788.916666666664 | 34.02 |
| 44788.927083333336 | 34.03 |
| 44788.9375 | 34.02 |
| 44788.947916666664 | 34.04 |
| 44788.958333333336 | 34.02 |
| 44788.96875 | 34.02 |
| 44788.979166666664 | 34.02 |
| 44788.989583333336 | 34.03 |
| 44789.0 | 34.03 |
| 44789.010416666664 | 34 |
| 44789.020833333336 | 34 |
| 44789.03125 | 33.99 |
| 44789.041666666664 | 33.99 |
| 44789.052083333336 | 33.97 |
| 44789.0625 | 33.96 |
| 44789.072916666664 | 33.97 |
| 44789.083333333336 | 33.97 |
| 44789.09375 | 33.97 |
| 44789.104166666664 | 33.94 |
| 44789.114583333336 | 33.93 |
| 44789.125 | 33.91 |
| 44789.135416666664 | 33.88 |
| 44789.145833333336 | 33.87 |
| 44789.15625 | 33.85 |
| 44789.166666666664 | 33.82 |
| 44789.177083333336 | 33.81 |
| 44789.1875 | 33.81 |
| 44789.197916666664 | 33.82 |
| 44789.208333333336 | 33.9 |
| 44789.21875 | 33.84 |
| 44789.229166666664 | 33.9 |
| 44789.239583333336 | 33.9 |
| 44789.25 | 33.87 |
| 44789.260416666664 | 33.9 |
| 44789.270833333336 | 33.93 |
| 44789.28125 | 33.93 |
| 44789.291666666664 | 33.93 |
| 44789.302083333336 | 33.94 |
| 44789.3125 | 33.96 |
| 44789.322916666664 | 33.96 |
| 44789.333333333336 | 33.9 |
| 44789.34375 | 33.92 |
| 44789.354166666664 | 33.92 |
| 44789.364583333336 | 33.93 |
| 44789.375 | 33.93 |
| 44789.385416666664 | 33.94 |
| 44789.395833333336 | 33.94 |
| 44789.40625 | 33.94 |
| 44789.416666666664 | 33.94 |
| 44789.427083333336 | 33.93 |
| 44789.4375 | 33.93 |
| 44789.447916666664 | 33.92 |
| 44789.458333333336 | 33.9 |
| 44789.46875 | 33.93 |
| 44789.479166666664 | 33.91 |
| 44789.489583333336 | 33.91 |
| 44789.5 | 33.91 |
| 44789.510416666664 | 33.92 |
| 44789.520833333336 | 33.93 |
| 44789.53125 | 33.93 |
| 44789.541666666664 | 33.92 |
| 44789.552083333336 | 33.91 |
| 44789.5625 | 33.9 |
| 44789.572916666664 | 33.9 |
| 44789.583333333336 | 33.9 |
| 44789.59375 | 33.91 |
| 44789.604166666664 | 33.92 |
| 44789.614583333336 | 33.92 |
| 44789.625 | 33.92 |
| 44789.635416666664 | 33.9 |
| 44789.645833333336 | 33.86 |
| 44789.65625 | 33.83 |
| 44789.666666666664 | 33.79 |
| 44789.677083333336 | 33.76 |
| 44789.6875 | 33.74 |
| 44789.697916666664 | 33.71 |
| 44789.708333333336 | 33.8 |
| 44789.71875 | 33.78 |
| 44789.729166666664 | 33.88 |
| 44789.739583333336 | 33.91 |
| 44789.75 | 33.94 |
| 44789.760416666664 | 33.89 |
| 44789.770833333336 | 33.93 |
| 44789.78125 | 33.94 |
| 44789.791666666664 | 33.93 |
| 44789.802083333336 | 33.94 |
| 44789.8125 | 33.95 |
| 44789.822916666664 | 33.99 |
| 44789.833333333336 | 33.93 |
| 44789.84375 | 33.96 |
| 44789.854166666664 | 33.93 |
| 44789.864583333336 | 33.98 |
| 44789.875 | 33.94 |
| 44789.885416666664 | 33.95 |
| 44789.895833333336 | 33.96 |
| 44789.90625 | 33.96 |
| 44789.916666666664 | 33.97 |
| 44789.927083333336 | 34.04 |
| 44789.9375 | 34.01 |
| 44789.947916666664 | 34.03 |
| 44789.958333333336 | 34.01 |
| 44789.96875 | 34 |
| 44789.979166666664 | 33.99 |
| 44789.989583333336 | 33.99 |
| 44790.0 | 33.98 |
| 44790.010416666664 | 33.96 |
| 44790.020833333336 | 33.95 |
| 44790.03125 | 33.95 |
| 44790.041666666664 | 33.95 |
| 44790.052083333336 | 33.95 |
| 44790.0625 | 33.92 |
| 44790.072916666664 | 33.9 |
| 44790.083333333336 | 33.87 |
| 44790.09375 | 33.85 |
| 44790.104166666664 | 33.83 |
| 44790.114583333336 | 33.8 |
| 44790.125 | 33.79 |
| 44790.135416666664 | 33.81 |
| 44790.145833333336 | 33.85 |
| 44790.15625 | 33.86 |
| 44790.166666666664 | 33.86 |
| 44790.177083333336 | 33.85 |
| 44790.1875 | 33.84 |
| 44790.197916666664 | 33.83 |
| 44790.208333333336 | 33.8 |
| 44790.21875 | 33.77 |
| 44790.229166666664 | 33.77 |
| 44790.239583333336 | 33.85 |
| 44790.25 | 33.82 |
| 44790.260416666664 | 33.86 |
| 44790.270833333336 | 33.86 |
| 44790.28125 | 33.87 |
| 44790.291666666664 | 33.89 |
| 44790.302083333336 | 33.89 |
| 44790.3125 | 33.92 |
| 44790.322916666664 | 33.89 |
| 44790.333333333336 | 33.92 |
| 44790.34375 | 33.92 |
| 44790.354166666664 | 33.95 |
| 44790.364583333336 | 33.95 |
| 44790.375 | 33.94 |
| 44790.385416666664 | 33.95 |
| 44790.395833333336 | 33.95 |
| 44790.40625 | 33.97 |
| 44790.416666666664 | 33.95 |
| 44790.427083333336 | 33.97 |
| 44790.4375 | 33.96 |
| 44790.447916666664 | 33.94 |
| 44790.458333333336 | 33.94 |
| 44790.46875 | 33.93 |
| 44790.479166666664 | 33.92 |
| 44790.489583333336 | 33.93 |
| 44790.5 | 33.92 |
| 44790.510416666664 | 33.93 |
| 44790.520833333336 | 33.92 |
| 44790.53125 | 33.92 |
| 44790.541666666664 | 33.92 |
| 44790.552083333336 | 33.92 |
| 44790.5625 | 33.89 |
| 44790.572916666664 | 33.79 |
| 44790.583333333336 | 33.8 |
| 44790.59375 | 33.84 |
| 44790.604166666664 | 33.85 |
| 44790.614583333336 | 33.86 |
| 44790.625 | 33.86 |
| 44790.635416666664 | 33.85 |
| 44790.645833333336 | 33.84 |
| 44790.65625 | 33.85 |
| 44790.666666666664 | 33.83 |
| 44790.677083333336 | 33.82 |
| 44790.6875 | 33.82 |
| 44790.697916666664 | 33.81 |
| 44790.708333333336 | 33.75 |
| 44790.71875 | 33.75 |
| 44790.729166666664 | 33.7 |
| 44790.739583333336 | 33.68 |
| 44790.75 | 33.67 |
| 44790.760416666664 | 33.72 |
| 44790.770833333336 | 33.79 |
| 44790.78125 | 33.87 |
| 44790.791666666664 | 33.91 |
| 44790.802083333336 | 33.89 |
| 44790.8125 | 33.9 |
| 44790.822916666664 | 33.94 |
| 44790.833333333336 | 33.9 |
| 44790.84375 | 33.89 |
| 44790.854166666664 | 33.92 |
| 44790.864583333336 | 33.92 |
| 44790.875 | 33.89 |
| 44790.885416666664 | 33.95 |
| 44790.895833333336 | 33.9 |
| 44790.90625 | 33.94 |
| 44790.916666666664 | 34.03 |
| 44790.927083333336 | 33.96 |
| 44790.9375 | 33.98 |
| 44790.947916666664 | 34.01 |
| 44790.958333333336 | 33.99 |
| 44790.96875 | 34.01 |
| 44790.979166666664 | 34.04 |
| 44790.989583333336 | 34.05 |
| 44791.0 | 34.06 |
| 44791.010416666664 | 34.03 |
| 44791.020833333336 | 34.02 |
| 44791.03125 | 34 |
| 44791.041666666664 | 33.99 |
| 44791.052083333336 | 33.99 |
| 44791.0625 | 33.98 |
| 44791.072916666664 | 33.96 |
| 44791.083333333336 | 33.95 |
| 44791.09375 | 33.93 |
| 44791.104166666664 | 33.89 |
| 44791.114583333336 | 33.84 |
| 44791.125 | 33.84 |
| 44791.135416666664 | 33.86 |
| 44791.145833333336 | 33.86 |
| 44791.15625 | 33.87 |
| 44791.166666666664 | 33.88 |
| 44791.177083333336 | 33.88 |
| 44791.1875 | 33.88 |
| 44791.197916666664 | 33.88 |
| 44791.208333333336 | 33.88 |
| 44791.21875 | 33.88 |
| 44791.229166666664 | 33.88 |
| 44791.239583333336 | 33.88 |
| 44791.25 | 33.88 |
| 44791.260416666664 | 33.9 |
| 44791.270833333336 | 33.89 |
| 44791.28125 | 33.91 |
| 44791.291666666664 | 33.89 |
| 44791.302083333336 | 33.89 |
| 44791.3125 | 33.91 |
| 44791.322916666664 | 33.94 |
| 44791.333333333336 | 33.91 |
| 44791.34375 | 33.95 |
| 44791.354166666664 | 33.91 |
| 44791.364583333336 | 33.9 |
| 44791.375 | 33.94 |
| 44791.385416666664 | 33.92 |
| 44791.395833333336 | 33.93 |
| 44791.40625 | 33.91 |
| 44791.416666666664 | 33.92 |
| 44791.427083333336 | 33.94 |
| 44791.4375 | 33.96 |
| 44791.447916666664 | 33.94 |
| 44791.458333333336 | 33.97 |
| 44791.46875 | 33.97 |
| 44791.479166666664 | 33.96 |
| 44791.489583333336 | 33.95 |
| 44791.5 | 33.96 |
| 44791.510416666664 | 33.96 |
| 44791.520833333336 | 33.96 |
| 44791.53125 | 33.95 |
| 44791.541666666664 | 33.95 |
| 44791.552083333336 | 33.94 |
| 44791.5625 | 33.95 |
| 44791.572916666664 | 33.95 |
| 44791.583333333336 | 33.95 |
| 44791.59375 | 33.93 |
| 44791.604166666664 | 33.89 |
| 44791.614583333336 | 33.87 |
| 44791.625 | 33.89 |
| 44791.635416666664 | 33.9 |
| 44791.645833333336 | 33.91 |
| 44791.65625 | 33.91 |
| 44791.666666666664 | 33.92 |
| 44791.677083333336 | 33.91 |
| 44791.6875 | 33.91 |
| 44791.697916666664 | 33.9 |
| 44791.708333333336 | 33.88 |
| 44791.71875 | 33.86 |
| 44791.729166666664 | 33.84 |
| 44791.739583333336 | 33.8 |
| 44791.75 | 33.78 |
| 44791.760416666664 | 33.77 |
| 44791.770833333336 | 33.76 |
| 44791.78125 | 33.77 |
| 44791.791666666664 | 33.9 |
| 44791.802083333336 | 33.83 |
| 44791.8125 | 33.85 |
| 44791.822916666664 | 33.88 |
| 44791.833333333336 | 33.86 |
| 44791.84375 | 33.85 |
| 44791.854166666664 | 33.92 |
| 44791.864583333336 | 33.93 |
| 44791.875 | 33.97 |
| 44791.885416666664 | 33.99 |
| 44791.895833333336 | 34.04 |
| 44791.90625 | 34.04 |
| 44791.916666666664 | 34.05 |
| 44791.927083333336 | 34 |
| 44791.9375 | 33.98 |
| 44791.947916666664 | 34 |
| 44791.958333333336 | 34.01 |
| 44791.96875 | 34.04 |
| 44791.979166666664 | 34.08 |
| 44791.989583333336 | 34.1 |
| 44792.0 | 34.07 |
| 44792.010416666664 | 34.06 |
| 44792.020833333336 | 34.03 |
| 44792.03125 | 34.02 |
| 44792.041666666664 | 34.02 |
| 44792.052083333336 | 34.03 |
| 44792.0625 | 34.03 |
| 44792.072916666664 | 34.03 |
| 44792.083333333336 | 34.01 |
| 44792.09375 | 34.01 |
| 44792.104166666664 | 33.96 |
| 44792.114583333336 | 34 |
| 44792.125 | 33.99 |
| 44792.135416666664 | 33.95 |
| 44792.145833333336 | 33.96 |
| 44792.15625 | 33.96 |
| 44792.166666666664 | 33.97 |
| 44792.177083333336 | 33.97 |
| 44792.1875 | 33.98 |
| 44792.197916666664 | 33.97 |
| 44792.208333333336 | 33.98 |
| 44792.21875 | 33.98 |
| 44792.229166666664 | 33.97 |
| 44792.239583333336 | 33.97 |
| 44792.25 | 33.97 |
| 44792.260416666664 | 33.97 |
| 44792.270833333336 | 33.97 |
| 44792.28125 | 33.96 |
| 44792.291666666664 | 33.97 |
| 44792.302083333336 | 33.94 |
| 44792.3125 | 33.97 |
| 44792.322916666664 | 33.98 |
| 44792.333333333336 | 33.97 |
| 44792.34375 | 34 |
| 44792.354166666664 | 34.01 |
| 44792.364583333336 | 34.01 |
| 44792.375 | 34.01 |
| 44792.385416666664 | 34.03 |
| 44792.395833333336 | 34.02 |
| 44792.40625 | 34.01 |
| 44792.416666666664 | 34.03 |
| 44792.427083333336 | 34.01 |
| 44792.4375 | 34 |
| 44792.447916666664 | 34.04 |
| 44792.458333333336 | 34.02 |
| 44792.46875 | 34.02 |
| 44792.479166666664 | 34 |
| 44792.489583333336 | 33.99 |
| 44792.5 | 33.98 |
| 44792.510416666664 | 33.98 |
| 44792.520833333336 | 33.97 |
| 44792.53125 | 33.96 |
| 44792.541666666664 | 33.97 |
| 44792.552083333336 | 33.97 |
| 44792.5625 | 33.98 |
| 44792.572916666664 | 33.97 |
| 44792.583333333336 | 33.98 |
| 44792.59375 | 33.99 |
| 44792.604166666664 | 34 |
| 44792.614583333336 | 34.02 |
| 44792.625 | 34.02 |
| 44792.635416666664 | 34.03 |
| 44792.645833333336 | 34.02 |
| 44792.65625 | 34.03 |
| 44792.666666666664 | 34.05 |
| 44792.677083333336 | 34.01 |
| 44792.6875 | 34.01 |
| 44792.697916666664 | 34.01 |
| 44792.708333333336 | 34 |
| 44792.71875 | 34 |
| 44792.729166666664 | 34 |
| 44792.739583333336 | 34.01 |
| 44792.75 | 34.02 |
| 44792.760416666664 | 34 |
| 44792.770833333336 | 33.99 |
| 44792.78125 | 33.95 |
| 44792.791666666664 | 33.95 |
| 44792.802083333336 | 33.93 |
| 44792.8125 | 33.94 |
| 44792.822916666664 | 33.94 |
| 44792.833333333336 | 33.96 |
| 44792.84375 | 33.95 |
| 44792.854166666664 | 33.96 |
| 44792.864583333336 | 34.04 |
| 44792.875 | 34.04 |
| 44792.885416666664 | 34.05 |
| 44792.895833333336 | 34.1 |
| 44792.90625 | 34.05 |
| 44792.916666666664 | 34.1 |
| 44792.927083333336 | 34.12 |
| 44792.9375 | 34.1 |
| 44792.947916666664 | 34.12 |
| 44792.958333333336 | 34.13 |
| 44792.96875 | 34.13 |
| 44792.979166666664 | 34.17 |
| 44792.989583333336 | 34.16 |
| 44793.0 | 34.09 |
| 44793.010416666664 | 34.09 |
| 44793.020833333336 | 34.13 |
| 44793.03125 | 34.15 |
| 44793.041666666664 | 34.14 |
| 44793.052083333336 | 34.13 |
| 44793.0625 | 34.12 |
| 44793.072916666664 | 34.11 |
| 44793.083333333336 | 34.1 |
| 44793.09375 | 34.1 |
| 44793.104166666664 | 34.11 |
| 44793.114583333336 | 34.09 |
| 44793.125 | 34.1 |
| 44793.135416666664 | 34.09 |
| 44793.145833333336 | 34.09 |
| 44793.15625 | 34.09 |
| 44793.166666666664 | 34.08 |
| 44793.177083333336 | 34.08 |
| 44793.1875 | 34.06 |
| 44793.197916666664 | 34.05 |
| 44793.208333333336 | 34.04 |
| 44793.21875 | 34.04 |
| 44793.229166666664 | 34.04 |
| 44793.239583333336 | 34.04 |
| 44793.25 | 34.04 |
| 44793.260416666664 | 34.04 |
| 44793.270833333336 | 34.04 |
| 44793.28125 | 34.04 |
| 44793.291666666664 | 34.04 |
| 44793.302083333336 | 34.04 |
| 44793.3125 | 34.04 |
| 44793.322916666664 | 34.04 |
| 44793.333333333336 | 34.03 |
| 44793.34375 | 34.02 |
| 44793.354166666664 | 34.03 |
| 44793.364583333336 | 34.04 |
| 44793.375 | 34.03 |
| 44793.385416666664 | 34.04 |
| 44793.395833333336 | 34.04 |
| 44793.40625 | 34.07 |
| 44793.416666666664 | 34.06 |
| 44793.427083333336 | 34.07 |
| 44793.4375 | 34.07 |
| 44793.447916666664 | 34.04 |
| 44793.458333333336 | 34.05 |
| 44793.46875 | 34.07 |
| 44793.479166666664 | 34.05 |
| 44793.489583333336 | 34.07 |
| 44793.5 | 34.05 |
| 44793.510416666664 | 34.02 |
| 44793.520833333336 | 34.01 |
| 44793.53125 | 34.01 |
| 44793.541666666664 | 34 |
| 44793.552083333336 | 34 |
| 44793.5625 | 34 |
| 44793.572916666664 | 34 |
| 44793.583333333336 | 34.01 |
| 44793.59375 | 34.02 |
| 44793.604166666664 | 34.02 |
| 44793.614583333336 | 34.03 |
| 44793.625 | 34.04 |
| 44793.635416666664 | 34.04 |
| 44793.645833333336 | 34.07 |
| 44793.65625 | 34.08 |
| 44793.666666666664 | 34.09 |
| 44793.677083333336 | 34.12 |
| 44793.6875 | 34.12 |
| 44793.697916666664 | 34.13 |
| 44793.708333333336 | 34.13 |
| 44793.71875 | 34.14 |
| 44793.729166666664 | 34.13 |
| 44793.739583333336 | 34.14 |
| 44793.75 | 34.15 |
| 44793.760416666664 | 34.16 |
| 44793.770833333336 | 34.16 |
| 44793.78125 | 34.17 |
| 44793.791666666664 | 34.18 |
| 44793.802083333336 | 34.18 |
| 44793.8125 | 34.16 |
| 44793.822916666664 | 34.16 |
| 44793.833333333336 | 34.13 |
| 44793.84375 | 34.11 |
| 44793.854166666664 | 34.13 |
| 44793.864583333336 | 34.11 |
| 44793.875 | 34.14 |
| 44793.885416666664 | 34.09 |
| 44793.895833333336 | 34.22 |
| 44793.90625 | 34.28 |
| 44793.916666666664 | 34.26 |
| 44793.927083333336 | 34.29 |
| 44793.9375 | 34.24 |
| 44793.947916666664 | 34.29 |
| 44793.958333333336 | 34.28 |
| 44793.96875 | 34.34 |
| 44793.979166666664 | 34.32 |
| 44793.989583333336 | 34.32 |
| 44794.0 | 34.35 |
| 44794.010416666664 | 34.37 |
| 44794.020833333336 | 34.31 |
| 44794.03125 | 34.33 |
| 44794.041666666664 | 34.27 |
| 44794.052083333336 | 34.28 |
| 44794.0625 | 34.27 |
| 44794.072916666664 | 34.24 |
| 44794.083333333336 | 34.24 |
| 44794.09375 | 34.23 |
| 44794.104166666664 | 34.21 |
| 44794.114583333336 | 34.21 |
| 44794.125 | 34.21 |
| 44794.135416666664 | 34.25 |
| 44794.145833333336 | 34.24 |
| 44794.15625 | 34.24 |
| 44794.166666666664 | 34.22 |
| 44794.177083333336 | 34.22 |
| 44794.1875 | 34.23 |
| 44794.197916666664 | 34.23 |
| 44794.208333333336 | 34.24 |
| 44794.21875 | 34.23 |
| 44794.229166666664 | 34.22 |
| 44794.239583333336 | 34.2 |
| 44794.25 | 34.2 |
| 44794.260416666664 | 34.19 |
| 44794.270833333336 | 34.19 |
| 44794.28125 | 34.19 |
| 44794.291666666664 | 34.2 |
| 44794.302083333336 | 34.2 |
| 44794.3125 | 34.21 |
| 44794.322916666664 | 34.21 |
| 44794.333333333336 | 34.22 |
| 44794.34375 | 34.21 |
| 44794.354166666664 | 34.22 |
| 44794.364583333336 | 34.23 |
| 44794.375 | 34.21 |
| 44794.385416666664 | 34.21 |
| 44794.395833333336 | 34.21 |
| 44794.40625 | 34.21 |
| 44794.416666666664 | 34.21 |
| 44794.427083333336 | 34.21 |
| 44794.4375 | 34.22 |
| 44794.447916666664 | 34.22 |
| 44794.458333333336 | 34.23 |
| 44794.46875 | 34.19 |
| 44794.479166666664 | 34.24 |
| 44794.489583333336 | 34.2 |
| 44794.5 | 34.19 |
| 44794.510416666664 | 34.19 |
| 44794.520833333336 | 34.2 |
| 44794.53125 | 34.19 |
| 44794.541666666664 | 34.16 |
| 44794.552083333336 | 34.19 |
| 44794.5625 | 34.2 |
| 44794.572916666664 | 34.19 |
| 44794.583333333336 | 34.16 |
| 44794.59375 | 34.18 |
| 44794.604166666664 | 34.15 |
| 44794.614583333336 | 34.15 |
| 44794.625 | 34.16 |
| 44794.635416666664 | 34.15 |
| 44794.645833333336 | 34.16 |
| 44794.65625 | 34.16 |
| 44794.666666666664 | 34.16 |
| 44794.677083333336 | 34.18 |
| 44794.6875 | 34.19 |
| 44794.697916666664 | 34.2 |
| 44794.708333333336 | 34.21 |
| 44794.71875 | 34.22 |
| 44794.729166666664 | 34.21 |
| 44794.739583333336 | 34.22 |
| 44794.75 | 34.19 |
| 44794.760416666664 | 34.19 |
| 44794.770833333336 | 34.19 |
| 44794.78125 | 34.17 |
| 44794.791666666664 | 34.14 |
| 44794.802083333336 | 34.14 |
| 44794.8125 | 34.14 |
| 44794.822916666664 | 34.15 |
| 44794.833333333336 | 34.15 |
| 44794.84375 | 34.14 |
| 44794.854166666664 | 12.39 |
| 44794.864583333336 | 34.12 |
| 44794.875 | 34.11 |
| 44794.885416666664 | 34.1 |
| 44794.895833333336 | 34.09 |
| 44794.90625 | 34.09 |
| 44794.916666666664 | 34.14 |
| 44794.927083333336 | 34.12 |
| 44794.9375 | 34.07 |
| 44794.947916666664 | 34.01 |
| 44794.958333333336 | 34.13 |
| 44794.96875 | 34.13 |
| 44794.979166666664 | 34.15 |
| 44794.989583333336 | 34.15 |
| 44795.0 | 34.13 |
| 44795.010416666664 | 34.13 |
| 44795.020833333336 | 34.13 |
| 44795.03125 | 34.13 |
| 44795.041666666664 | 34.14 |
| 44795.052083333336 | 34.14 |
| 44795.0625 | 34.15 |
| 44795.072916666664 | 34.16 |
| 44795.083333333336 | 34.17 |
| 44795.09375 | 34.19 |
| 44795.104166666664 | 34.19 |
| 44795.114583333336 | 34.2 |
| 44795.125 | 34.2 |
| 44795.135416666664 | 34.19 |
| 44795.145833333336 | 34.2 |
| 44795.15625 | 34.2 |
| 44795.166666666664 | 34.17 |
| 44795.177083333336 | 34.17 |
| 44795.1875 | 34.18 |
| 44795.197916666664 | 34.17 |
| 44795.208333333336 | 34.15 |
| 44795.21875 | 34.14 |
| 44795.229166666664 | 34.14 |
| 44795.239583333336 | 34.13 |
| 44795.25 | 34.11 |
| 44795.260416666664 | 34.1 |
| 44795.270833333336 | 34.11 |
| 44795.28125 | 34.11 |
| 44795.291666666664 | 34.12 |
| 44795.302083333336 | 34.12 |
| 44795.3125 | 34.13 |
| 44795.322916666664 | 34.13 |
| 44795.333333333336 | 34.13 |
| 44795.34375 | 34.12 |
| 44795.354166666664 | 34.13 |
| 44795.364583333336 | 34.12 |
| 44795.375 | 34.13 |
| 44795.385416666664 | 34.13 |
| 44795.395833333336 | 34.13 |
| 44795.40625 | 34.13 |
| 44795.416666666664 | 34.07 |
| 44795.427083333336 | 34.1 |
| 44795.4375 | 34.05 |
| 44795.447916666664 | 34.08 |
| 44795.458333333336 | 34.07 |
| 44795.46875 | 34.09 |
| 44795.479166666664 | 34.09 |
| 44795.489583333336 | 34.1 |
| 44795.5 | 34.09 |
| 44795.510416666664 | 34.08 |
| 44795.520833333336 | 34.09 |
| 44795.53125 | 34.06 |
| 44795.541666666664 | 34.06 |
| 44795.552083333336 | 34.01 |
| 44795.5625 | 34.04 |
| 44795.572916666664 | 34.05 |
| 44795.583333333336 | 34.06 |
| 44795.59375 | 34.05 |
| 44795.604166666664 | 34.05 |
| 44795.614583333336 | 34.04 |
| 44795.625 | 34.04 |
| 44795.635416666664 | 34.04 |
| 44795.645833333336 | 34.04 |
| 44795.65625 | 34.02 |
| 44795.666666666664 | 34.04 |
| 44795.677083333336 | 34.04 |
| 44795.6875 | 15.44 |
| 44795.697916666664 | 34.03 |
| 44795.708333333336 | 33.96 |
| 44795.71875 | 34.05 |
| 44795.729166666664 | 34 |
| 44795.739583333336 | 34.07 |
| 44795.75 | 34.08 |
| 44795.760416666664 | 34.08 |
| 44795.770833333336 | 34.07 |
| 44795.78125 | 34.08 |
| 44795.791666666664 | 34.11 |
| 44795.802083333336 | 34.13 |
| 44795.8125 | 34.16 |
| 44795.822916666664 | 34.19 |
| 44795.833333333336 | 34.23 |
| 44795.84375 | 34.24 |
| 44795.854166666664 | 34.26 |
| 44795.864583333336 | 34.28 |
| 44795.875 | 34.3 |
| 44795.885416666664 | 34.32 |
| 44795.895833333336 | 34.34 |
| 44795.90625 | 34.35 |
| 44795.916666666664 | 34.34 |
| 44795.927083333336 | 34.31 |
| 44795.9375 | 34.28 |
| 44795.947916666664 | 34.27 |
| 44795.958333333336 | 17.95 |
| 44795.96875 | 34.24 |
| 44795.979166666664 | 34.25 |
| 44795.989583333336 | 34.27 |
| 44796.0 | 34.31 |
| 44796.010416666664 | 34.3 |
| 44796.020833333336 | 34.31 |
| 44796.03125 | 34.29 |
| 44796.041666666664 | 34.31 |
| 44796.052083333336 | 34.29 |
| 44796.0625 | 34.33 |
| 44796.072916666664 | 34.31 |
| 44796.083333333336 | 34.26 |
| 44796.09375 | 34.29 |
| 44796.104166666664 | 34.25 |
| 44796.114583333336 | 34.24 |
| 44796.125 | 34.21 |
| 44796.135416666664 | 34.14 |
| 44796.145833333336 | 34.14 |
| 44796.15625 | 34.11 |
| 44796.166666666664 | 34.07 |
| 44796.177083333336 | 34.06 |
| 44796.1875 | 34.06 |
| 44796.197916666664 | 34.06 |
| 44796.208333333336 | 34.07 |
| 44796.21875 | 34.09 |
| 44796.229166666664 | 34.1 |
| 44796.239583333336 | 34.09 |
| 44796.25 | 34.09 |
| 44796.260416666664 | 34.11 |
| 44796.270833333336 | 34.14 |
| 44796.28125 | 34.15 |
| 44796.291666666664 | 34.18 |
| 44796.302083333336 | 34.21 |
| 44796.3125 | 34.21 |
| 44796.322916666664 | 34.22 |
| 44796.333333333336 | 34.23 |
| 44796.34375 | 34.24 |
| 44796.354166666664 | 34.25 |
| 44796.364583333336 | 34.26 |
| 44796.375 | 34.27 |
| 44796.385416666664 | 34.27 |
| 44796.395833333336 | 34.28 |
| 44796.40625 | 34.28 |
| 44796.416666666664 | 34.29 |
| 44796.427083333336 | 34.29 |
| 44796.4375 | 34.28 |
| 44796.447916666664 | 34.28 |
| 44796.458333333336 | 34.23 |
| 44796.46875 | 34.26 |
| 44796.479166666664 | 34.26 |
| 44796.489583333336 | 34.26 |
| 44796.5 | 34.31 |
| 44796.510416666664 | 34.27 |
| 44796.520833333336 | 34.26 |
| 44796.53125 | 34.25 |
| 44796.541666666664 | 34.26 |
| 44796.552083333336 | 34.26 |
| 44796.5625 | 34.22 |
| 44796.572916666664 | 34.21 |
| 44796.583333333336 | 34.13 |
| 44796.59375 | 34.14 |
| 44796.604166666664 | 34.15 |
| 44796.614583333336 | 34.12 |
| 44796.625 | 34.07 |
| 44796.635416666664 | 34.07 |
| 44796.645833333336 | 34.05 |
| 44796.65625 | 34.1 |
| 44796.666666666664 | 34.05 |
| 44796.677083333336 | 34.05 |
| 44796.6875 | 34.06 |
| 44796.697916666664 | 34 |
| 44796.708333333336 | 34.06 |
| 44796.71875 | 34.02 |
| 44796.729166666664 | 34.01 |
| 44796.739583333336 | 34 |
| 44796.75 | 34.01 |
| 44796.760416666664 | 34.03 |
| 44796.770833333336 | 34.07 |
| 44796.78125 | 34.13 |
| 44796.791666666664 | 34.16 |
| 44796.802083333336 | 34.21 |
| 44796.8125 | 34.21 |
| 44796.822916666664 | 34.22 |
| 44796.833333333336 | 34.24 |
| 44796.84375 | 34.26 |
| 44796.854166666664 | 34.28 |
| 44796.864583333336 | 34.3 |
| 44796.875 | 34.32 |
| 44796.885416666664 | 34.34 |
| 44796.895833333336 | 34.34 |
| 44796.90625 | 34.32 |
| 44796.916666666664 | 34.28 |
| 44796.927083333336 | 34.25 |
| 44796.9375 | 34.23 |
| 44796.947916666664 | 34.22 |
| 44796.958333333336 | 34.2 |
| 44796.96875 | 34.17 |
| 44796.979166666664 | 34.17 |
| 44796.989583333336 | 34.21 |
| 44797.0 | 34.13 |
| 44797.010416666664 | 34.16 |
| 44797.020833333336 | 34.28 |
| 44797.03125 | 34.29 |
| 44797.041666666664 | 34.36 |
| 44797.052083333336 | 34.33 |
| 44797.0625 | 34.38 |
| 44797.072916666664 | 34.42 |
| 44797.083333333336 | 34.41 |
| 44797.09375 | 34.48 |
| 44797.104166666664 | 34.34 |
| 44797.114583333336 | 34.33 |
| 44797.125 | 34.33 |
| 44797.135416666664 | 34.27 |
| 44797.145833333336 | 34.29 |
| 44797.15625 | 34.23 |
| 44797.166666666664 | 34.2 |
| 44797.177083333336 | 34.18 |
| 44797.1875 | 34.15 |
| 44797.197916666664 | 34.12 |
| 44797.208333333336 | 34.11 |
| 44797.21875 | 34.11 |
| 44797.229166666664 | 34.08 |
| 44797.239583333336 | 34.08 |
| 44797.25 | 34.08 |
| 44797.260416666664 | 34.12 |
| 44797.270833333336 | 34.12 |
| 44797.28125 | 34.11 |
| 44797.291666666664 | 34.13 |
| 44797.302083333336 | 34.16 |
| 44797.3125 | 34.2 |
| 44797.322916666664 | 34.23 |
| 44797.333333333336 | 34.25 |
| 44797.34375 | 34.24 |
| 44797.354166666664 | 34.22 |
| 44797.364583333336 | 34.23 |
| 44797.375 | 34.24 |
| 44797.385416666664 | 34.26 |
| 44797.395833333336 | 34.27 |
| 44797.40625 | 34.28 |
| 44797.416666666664 | 34.28 |
| 44797.427083333336 | 34.28 |
| 44797.4375 | 34.29 |
| 44797.447916666664 | 34.29 |
| 44797.458333333336 | 34.3 |
| 44797.46875 | 34.3 |
| 44797.479166666664 | 34.28 |
| 44797.489583333336 | 34.26 |
| 44797.5 | 34.27 |
| 44797.510416666664 | 34.26 |
| 44797.520833333336 | 34.28 |
| 44797.53125 | 34.28 |
| 44797.541666666664 | 34.3 |
| 44797.552083333336 | 34.3 |
| 44797.5625 | 34.31 |
| 44797.572916666664 | 34.32 |
| 44797.583333333336 | 34.31 |
| 44797.59375 | 34.31 |
| 44797.604166666664 | 34.3 |
| 44797.614583333336 | 34.2 |
| 44797.625 | 34.24 |
| 44797.635416666664 | 34.25 |
| 44797.645833333336 | 34.22 |
| 44797.65625 | 34.2 |
| 44797.666666666664 | 34.2 |
| 44797.677083333336 | 34.17 |
| 44797.6875 | 34.18 |
| 44797.697916666664 | 34.12 |
| 44797.708333333336 | 34.13 |
| 44797.71875 | 34.06 |
| 44797.729166666664 | 34.02 |
| 44797.739583333336 | 34.05 |
| 44797.75 | 34.1 |
| 44797.760416666664 | 34.03 |
| 44797.770833333336 | 34.05 |
| 44797.78125 | 34.07 |
| 44797.791666666664 | 34.11 |
| 44797.802083333336 | 34.16 |
| 44797.8125 | 34.19 |
| 44797.822916666664 | 34.23 |
| 44797.833333333336 | 34.26 |
| 44797.84375 | 34.27 |
| 44797.854166666664 | 34.29 |
| 44797.864583333336 | 34.31 |
| 44797.875 | 34.33 |
| 44797.885416666664 | 34.34 |
| 44797.895833333336 | 34.35 |
| 44797.90625 | 34.36 |
| 44797.916666666664 | 34.36 |
| 44797.927083333336 | 34.35 |
| 44797.9375 | 34.32 |
| 44797.947916666664 | 34.28 |
| 44797.958333333336 | 34.26 |
| 44797.96875 | 34.21 |
| 44797.979166666664 | 34.18 |
| 44797.989583333336 | 34.18 |
| 44798.0 | 34.18 |
| 44798.010416666664 | 34.18 |
| 44798.020833333336 | 34.26 |
| 44798.03125 | 34.21 |
| 44798.041666666664 | 34.24 |
| 44798.052083333336 | 34.27 |
| 44798.0625 | 34.34 |
| 44798.072916666664 | 34.35 |
| 44798.083333333336 | 34.36 |
| 44798.09375 | 34.35 |
| 44798.104166666664 | 23.6 |
| 44798.114583333336 | 34.47 |
| 44798.125 | 34.44 |
| 44798.135416666664 | 34.38 |
| 44798.145833333336 | 34.41 |
| 44798.15625 | 34.39 |
| 44798.166666666664 | 34.38 |
| 44798.177083333336 | 34.36 |
| 44798.1875 | 34.33 |
| 44798.197916666664 | 34.3 |
| 44798.208333333336 | 34.28 |
| 44798.21875 | 34.24 |
| 44798.229166666664 | 34.2 |
| 44798.239583333336 | 34.17 |
| 44798.25 | 34.16 |
| 44798.260416666664 | 34.17 |
| 44798.270833333336 | 34.16 |
| 44798.28125 | 34.2 |
| 44798.291666666664 | 34.2 |
| 44798.302083333336 | 34.2 |
| 44798.3125 | 34.22 |
| 44798.322916666664 | 34.24 |
| 44798.333333333336 | 34.26 |
| 44798.34375 | 34.3 |
| 44798.354166666664 | 34.31 |
| 44798.364583333336 | 34.3 |
| 44798.375 | 34.3 |
| 44798.385416666664 | 34.3 |
| 44798.395833333336 | 34.3 |
| 44798.40625 | 34.31 |
| 44798.416666666664 | 34.31 |
| 44798.427083333336 | 34.32 |
| 44798.4375 | 34.33 |
| 44798.447916666664 | 34.34 |
| 44798.458333333336 | 34.33 |
| 44798.46875 | 34.33 |
| 44798.479166666664 | 34.33 |
| 44798.489583333336 | 34.32 |
| 44798.5 | 34.32 |
| 44798.510416666664 | 34.32 |
| 44798.520833333336 | 34.3 |
| 44798.53125 | 34.31 |
| 44798.541666666664 | 34.31 |
| 44798.552083333336 | 34.31 |
| 44798.5625 | 34.33 |
| 44798.572916666664 | 34.35 |
| 44798.583333333336 | 34.35 |
| 44798.59375 | 34.36 |
| 44798.604166666664 | 34.37 |
| 44798.614583333336 | 34.36 |
| 44798.625 | 34.38 |
| 44798.635416666664 | 34.41 |
| 44798.645833333336 | 34.38 |
| 44798.65625 | 34.4 |
| 44798.666666666664 | 34.36 |
| 44798.677083333336 | 34.32 |
| 44798.6875 | 34.3 |
| 44798.697916666664 | 34.27 |
| 44798.708333333336 | 34.23 |
| 44798.71875 | 34.16 |
| 44798.729166666664 | 34.14 |
| 44798.739583333336 | 34.13 |
| 44798.75 | 34.14 |
| 44798.760416666664 | 34.13 |
| 44798.770833333336 | 34.16 |
| 44798.78125 | 34.18 |
| 44798.791666666664 | 34.16 |
| 44798.802083333336 | 34.19 |
| 44798.8125 | 34.24 |
| 44798.822916666664 | 34.29 |
| 44798.833333333336 | 34.29 |
| 44798.84375 | 34.31 |
| 44798.854166666664 | 34.33 |
| 44798.864583333336 | 34.34 |
| 44798.875 | 34.36 |
| 44798.885416666664 | 34.37 |
| 44798.895833333336 | 34.38 |
| 44798.90625 | 34.39 |
| 44798.916666666664 | 34.39 |
| 44798.927083333336 | 34.37 |
| 44798.9375 | 34.36 |
| 44798.947916666664 | 34.32 |
| 44798.958333333336 | 34.3 |
| 44798.96875 | 34.28 |
| 44798.979166666664 | 34.28 |
| 44798.989583333336 | 34.31 |
| 44799.0 | 34.34 |
| 44799.010416666664 | 34.36 |
| 44799.020833333336 | 34.37 |
| 44799.03125 | 34.38 |
| 44799.041666666664 | 34.39 |
| 44799.052083333336 | 34.34 |
| 44799.0625 | 34.35 |
| 44799.072916666664 | 34.36 |
| 44799.083333333336 | 34.34 |
| 44799.09375 | 34.36 |
| 44799.104166666664 | 34.37 |
| 44799.114583333336 | 34.38 |
| 44799.125 | 34.43 |
| 44799.135416666664 | 34.43 |
| 44799.145833333336 | 34.44 |
| 44799.15625 | 34.48 |
| 44799.166666666664 | 34.46 |
| 44799.177083333336 | 34.44 |
| 44799.1875 | 34.47 |
| 44799.197916666664 | 34.45 |
| 44799.208333333336 | 34.42 |
| 44799.21875 | 34.42 |
| 44799.229166666664 | 34.4 |
| 44799.239583333336 | 34.38 |
| 44799.25 | 34.39 |
| 44799.260416666664 | 34.33 |
| 44799.270833333336 | 34.33 |
| 44799.28125 | 34.32 |
| 44799.291666666664 | 34.32 |
| 44799.302083333336 | 34.34 |
| 44799.3125 | 34.35 |
| 44799.322916666664 | 34.34 |
| 44799.333333333336 | 34.34 |
| 44799.34375 | 34.36 |
| 44799.354166666664 | 34.38 |
| 44799.364583333336 | 34.41 |
| 44799.375 | 34.43 |
| 44799.385416666664 | 34.45 |
| 44799.395833333336 | 34.46 |
| 44799.40625 | 34.46 |
| 44799.416666666664 | 34.45 |
| 44799.427083333336 | 34.45 |
| 44799.4375 | 34.45 |
| 44799.447916666664 | 34.45 |
| 44799.458333333336 | 34.45 |
| 44799.46875 | 34.46 |
| 44799.479166666664 | 34.47 |
| 44799.489583333336 | 34.48 |
| 44799.5 | 34.5 |
| 44799.510416666664 | 34.52 |
| 44799.520833333336 | 34.53 |
| 44799.53125 | 34.52 |
| 44799.541666666664 | 34.51 |
| 44799.552083333336 | 34.42 |
| 44799.5625 | 34.45 |
| 44799.572916666664 | 34.46 |
| 44799.583333333336 | 34.45 |
| 44799.59375 | 34.47 |
| 44799.604166666664 | 34.51 |
| 44799.614583333336 | 34.52 |
| 44799.625 | 34.57 |
| 44799.635416666664 | 34.56 |
| 44799.645833333336 | 34.48 |
| 44799.65625 | 34.54 |
| 44799.666666666664 | 34.54 |
| 44799.677083333336 | 34.52 |
| 44799.6875 | 34.51 |
| 44799.697916666664 | 34.49 |
| 44799.708333333336 | 34.49 |
| 44799.71875 | 34.45 |
| 44799.729166666664 | 34.44 |
| 44799.739583333336 | 34.43 |
| 44799.75 | 34.42 |
| 44799.760416666664 | 34.41 |
| 44799.770833333336 | 34.42 |
| 44799.78125 | 34.42 |
| 44799.791666666664 | 34.43 |
| 44799.802083333336 | 34.43 |
| 44799.8125 | 34.41 |
| 44799.822916666664 | 34.4 |
| 44799.833333333336 | 34.43 |
| 44799.84375 | 34.47 |
| 44799.854166666664 | 34.52 |
| 44799.864583333336 | 34.53 |
| 44799.875 | 34.56 |
| 44799.885416666664 | 34.6 |
| 44799.895833333336 | 34.66 |
| 44799.90625 | 34.69 |
| 44799.916666666664 | 34.71 |
| 44799.927083333336 | 34.75 |
| 44799.9375 | 34.76 |
| 44799.947916666664 | 34.78 |
| 44799.958333333336 | 34.84 |
| 44799.96875 | 34.86 |
| 44799.979166666664 | 34.8 |
| 44799.989583333336 | 34.72 |
| 44800.0 | 34.55 |
| 44800.010416666664 | 34.6 |
| 44800.020833333336 | 34.57 |
| 44800.03125 | 34.55 |
| 44800.041666666664 | 34.53 |
| 44800.052083333336 | 34.54 |
| 44800.0625 | 34.55 |
| 44800.072916666664 | 34.57 |
| 44800.083333333336 | 34.59 |
| 44800.09375 | 34.6 |
| 44800.104166666664 | 34.62 |
| 44800.114583333336 | 34.68 |
| 44800.125 | 34.7 |
| 44800.135416666664 | 34.7 |
| 44800.145833333336 | 34.7 |
| 44800.15625 | 34.74 |
| 44800.166666666664 | 34.78 |
| 44800.177083333336 | 34.77 |
| 44800.1875 | 34.74 |
| 44800.197916666664 | 34.78 |
| 44800.208333333336 | 34.75 |
| 44800.21875 | 34.72 |
| 44800.229166666664 | 34.71 |
| 44800.239583333336 | 34.67 |
| 44800.25 | 34.66 |
| 44800.260416666664 | 34.6 |
| 44800.270833333336 | 34.6 |
| 44800.28125 | 34.57 |
| 44800.291666666664 | 34.55 |
| 44800.302083333336 | 34.54 |
| 44800.3125 | 34.55 |
| 44800.322916666664 | 34.57 |
| 44800.333333333336 | 34.59 |
| 44800.34375 | 34.56 |
| 44800.354166666664 | 34.57 |
| 44800.364583333336 | 34.59 |
| 44800.375 | 34.61 |
| 44800.385416666664 | 34.67 |
| 44800.395833333336 | 34.69 |
| 44800.40625 | 34.71 |
| 44800.416666666664 | 34.71 |
| 44800.427083333336 | 34.73 |
| 44800.4375 | 34.75 |
| 44800.447916666664 | 34.75 |
| 44800.458333333336 | 34.76 |
| 44800.46875 | 34.77 |
| 44800.479166666664 | 34.78 |
| 44800.489583333336 | 34.79 |
| 44800.5 | 34.81 |
| 44800.510416666664 | 34.82 |
| 44800.520833333336 | 34.81 |
| 44800.53125 | 34.76 |
| 44800.541666666664 | 12.76 |
| 44800.552083333336 | 34.67 |
| 44800.5625 | 34.66 |
| 44800.572916666664 | 34.59 |
| 44800.583333333336 | 34.56 |
| 44800.59375 | 34.67 |
| 44800.604166666664 | 34.58 |
| 44800.614583333336 | 34.71 |
| 44800.625 | 34.79 |
| 44800.635416666664 | 34.77 |
| 44800.645833333336 | 34.81 |
| 44800.65625 | 34.79 |
| 44800.666666666664 | 34.82 |
| 44800.677083333336 | 34.81 |
| 44800.6875 | 34.74 |
| 44800.697916666664 | 34.7 |
| 44800.708333333336 | 34.73 |
| 44800.71875 | 34.72 |
| 44800.729166666664 | 34.71 |
| 44800.739583333336 | 34.68 |
| 44800.75 | 34.7 |
| 44800.760416666664 | 34.66 |
| 44800.770833333336 | 34.7 |
| 44800.78125 | 34.65 |
| 44800.791666666664 | 34.63 |
| 44800.802083333336 | 34.61 |
| 44800.8125 | 34.61 |
| 44800.822916666664 | 34.66 |
| 44800.833333333336 | 34.64 |
| 44800.84375 | 34.62 |
| 44800.854166666664 | 34.6 |
| 44800.864583333336 | 34.6 |
| 44800.875 | 34.63 |
| 44800.885416666664 | 34.65 |
| 44800.895833333336 | 19.73 |
| 44800.90625 | 34.64 |
| 44800.916666666664 | 34.65 |
| 44800.927083333336 | 34.66 |
| 44800.9375 | 34.65 |
| 44800.947916666664 | 34.66 |
| 44800.958333333336 | 34.67 |
| 44800.96875 | 34.66 |
| 44800.979166666664 | 34.63 |
| 44800.989583333336 | 34.62 |
| 44801.0 | 34.6 |
| 44801.010416666664 | 34.57 |
| 44801.020833333336 | 34.52 |
| 44801.03125 | 34.49 |
| 44801.041666666664 | 34.43 |
| 44801.052083333336 | 34.43 |
| 44801.0625 | 34.36 |
| 44801.072916666664 | 34.4 |
| 44801.083333333336 | 34.38 |
| 44801.09375 | 34.43 |
| 44801.104166666664 | 34.56 |
| 44801.114583333336 | 34.36 |
| 44801.125 | 34.42 |
| 44801.135416666664 | 34.4 |
| 44801.145833333336 | 34.44 |
| 44801.15625 | 34.53 |
| 44801.166666666664 | 34.51 |
| 44801.177083333336 | 34.59 |
| 44801.1875 | 34.65 |
| 44801.197916666664 | 34.7 |
| 44801.208333333336 | 34.68 |
| 44801.21875 | 34.63 |
| 44801.229166666664 | 34.57 |
| 44801.239583333336 | 34.57 |
| 44801.25 | 34.6 |
| 44801.260416666664 | 34.64 |
| 44801.270833333336 | 34.64 |
| 44801.28125 | 34.66 |
| 44801.291666666664 | 34.67 |
| 44801.302083333336 | 34.66 |
| 44801.3125 | 34.65 |
| 44801.322916666664 | 34.65 |
| 44801.333333333336 | 34.63 |
| 44801.34375 | 34.63 |
| 44801.354166666664 | 34.63 |
| 44801.364583333336 | 34.63 |
| 44801.375 | 34.63 |
| 44801.385416666664 | 34.64 |
| 44801.395833333336 | 34.64 |
| 44801.40625 | 34.64 |
| 44801.416666666664 | 34.63 |
| 44801.427083333336 | 34.62 |
| 44801.4375 | 34.61 |
| 44801.447916666664 | 34.61 |
| 44801.458333333336 | 34.6 |
| 44801.46875 | 34.6 |
| 44801.479166666664 | 34.6 |
| 44801.489583333336 | 34.61 |
| 44801.5 | 34.6 |
| 44801.510416666664 | 34.59 |
| 44801.520833333336 | 34.57 |
| 44801.53125 | 34.55 |
| 44801.541666666664 | 34.49 |
| 44801.552083333336 | 34.47 |
| 44801.5625 | 34.44 |
| 44801.572916666664 | 34.37 |
| 44801.583333333336 | 34.3 |
| 44801.59375 | 34.29 |
| 44801.604166666664 | 34.28 |
| 44801.614583333336 | 34.38 |
| 44801.625 | 34.29 |
| 44801.635416666664 | 34.33 |
| 44801.645833333336 | 34.46 |
| 44801.65625 | 34.57 |
| 44801.666666666664 | 34.58 |
| 44801.677083333336 | 34.59 |
| 44801.6875 | 34.6 |
| 44801.697916666664 | 34.62 |
| 44801.708333333336 | 34.64 |
| 44801.71875 | 34.67 |
| 44801.729166666664 | 34.66 |
| 44801.739583333336 | 34.64 |
| 44801.75 | 34.61 |
| 44801.760416666664 | 34.62 |
| 44801.770833333336 | 34.63 |
| 44801.78125 | 34.63 |
| 44801.791666666664 | 34.63 |
| 44801.802083333336 | 34.65 |
| 44801.8125 | 34.67 |
| 44801.822916666664 | 34.66 |
| 44801.833333333336 | 34.67 |
| 44801.84375 | 34.66 |
| 44801.854166666664 | 34.64 |
| 44801.864583333336 | 34.63 |
| 44801.875 | 34.62 |
| 44801.885416666664 | 34.61 |
| 44801.895833333336 | 34.6 |
| 44801.90625 | 34.61 |
| 44801.916666666664 | 34.58 |
| 44801.927083333336 | 34.56 |
| 44801.9375 | 34.53 |
| 44801.947916666664 | 34.53 |
| 44801.958333333336 | 34.54 |
| 44801.96875 | 34.54 |
| 44801.979166666664 | 34.53 |
| 44801.989583333336 | 34.54 |
| 44802.0 | 34.54 |
| 44802.010416666664 | 34.54 |
| 44802.020833333336 | 34.53 |
| 44802.03125 | 34.51 |
| 44802.041666666664 | 34.47 |
| 44802.052083333336 | 34.43 |
| 44802.0625 | 34.39 |
| 44802.072916666664 | 34.33 |
| 44802.083333333336 | 34.31 |
| 44802.09375 | 34.29 |
| 44802.104166666664 | 34.28 |
| 44802.114583333336 | 34.52 |
| 44802.125 | 34.5 |
| 44802.135416666664 | 34.25 |
| 44802.145833333336 | 34.23 |
| 44802.15625 | 34.26 |
| 44802.166666666664 | 34.3 |
| 44802.177083333336 | 34.41 |
| 44802.1875 | 34.41 |
| 44802.197916666664 | 34.44 |
| 44802.208333333336 | 34.55 |
| 44802.21875 | 34.57 |
| 44802.229166666664 | 34.63 |
| 44802.239583333336 | 34.51 |
| 44802.25 | 34.46 |
| 44802.260416666664 | 34.51 |
| 44802.270833333336 | 34.52 |
| 44802.28125 | 34.52 |
| 44802.291666666664 | 34.55 |
| 44802.302083333336 | 34.57 |
| 44802.3125 | 34.59 |
| 44802.322916666664 | 34.59 |
| 44802.333333333336 | 34.6 |
| 44802.34375 | 34.6 |
| 44802.354166666664 | 34.58 |
| 44802.364583333336 | 34.59 |
| 44802.375 | 34.59 |
| 44802.385416666664 | 34.55 |
| 44802.395833333336 | 34.56 |
| 44802.40625 | 34.56 |
| 44802.416666666664 | 34.54 |
| 44802.427083333336 | 34.56 |
| 44802.4375 | 34.55 |
| 44802.447916666664 | 34.53 |
| 44802.458333333336 | 34.51 |
| 44802.46875 | 34.51 |
| 44802.479166666664 | 34.51 |
| 44802.489583333336 | 34.5 |
| 44802.5 | 34.5 |
| 44802.510416666664 | 34.49 |
| 44802.520833333336 | 34.5 |
| 44802.53125 | 34.5 |
| 44802.541666666664 | 34.48 |
| 44802.552083333336 | 34.46 |
| 44802.5625 | 34.44 |
| 44802.572916666664 | 34.4 |
| 44802.583333333336 | 34.35 |
| 44802.59375 | 34.31 |
| 44802.604166666664 | 34.24 |
| 44802.614583333336 | 34.17 |
| 44802.625 | 34.12 |
| 44802.635416666664 | 34.2 |
| 44802.645833333336 | 34.16 |
| 44802.65625 | 34.33 |
| 44802.666666666664 | 34.45 |
| 44802.677083333336 | 34.42 |
| 44802.6875 | 34.48 |
| 44802.697916666664 | 34.49 |
| 44802.708333333336 | 34.48 |
| 44802.71875 | 34.5 |
| 44802.729166666664 | 34.54 |
| 44802.739583333336 | 34.56 |
| 44802.75 | 34.48 |
| 44802.760416666664 | 34.47 |
| 44802.770833333336 | 34.47 |
| 44802.78125 | 34.5 |
| 44802.791666666664 | 34.51 |
| 44802.802083333336 | 34.57 |
| 44802.8125 | 34.57 |
| 44802.822916666664 | 34.6 |
| 44802.833333333336 | 34.59 |
| 44802.84375 | 34.61 |
| 44802.854166666664 | 34.6 |
| 44802.864583333336 | 34.63 |
| 44802.875 | 34.61 |
| 44802.885416666664 | 34.59 |
| 44802.895833333336 | 34.58 |
| 44802.90625 | 34.58 |
| 44802.916666666664 | 34.56 |
| 44802.927083333336 | 34.56 |
| 44802.9375 | 34.55 |
| 44802.947916666664 | 34.52 |
| 44802.958333333336 | 34.51 |
| 44802.96875 | 34.51 |
| 44802.979166666664 | 34.49 |
| 44802.989583333336 | 34.47 |
| 44803.0 | 34.44 |
| 44803.010416666664 | 34.44 |
| 44803.020833333336 | 34.47 |
| 44803.03125 | 34.47 |
| 44803.041666666664 | 34.46 |
| 44803.052083333336 | 34.46 |
| 44803.0625 | 34.46 |
| 44803.072916666664 | 34.42 |
| 44803.083333333336 | 34.44 |
| 44803.09375 | 34.42 |
| 44803.104166666664 | 34.39 |
| 44803.114583333336 | 34.37 |
| 44803.125 | 34.34 |
| 44803.135416666664 | 34.34 |
| 44803.145833333336 | 34.49 |
| 44803.15625 | 34.4 |
| 44803.166666666664 | 34.31 |
| 44803.177083333336 | 34.24 |
| 44803.1875 | 34.31 |
| 44803.197916666664 | 34.34 |
| 44803.208333333336 | 34.37 |
| 44803.21875 | 34.39 |
| 44803.229166666664 | 34.45 |
| 44803.239583333336 | 34.51 |
| 44803.25 | 34.56 |
| 44803.260416666664 | 34.45 |
| 44803.270833333336 | 34.5 |
| 44803.28125 | 34.43 |
| 44803.291666666664 | 34.47 |
| 44803.302083333336 | 34.49 |
| 44803.3125 | 34.52 |
| 44803.322916666664 | 34.52 |
| 44803.333333333336 | 34.48 |
| 44803.34375 | 34.5 |
| 44803.354166666664 | 34.49 |
| 44803.364583333336 | 34.52 |
| 44803.375 | 34.51 |
| 44803.385416666664 | 34.51 |
| 44803.395833333336 | 34.5 |
| 44803.40625 | 34.48 |
| 44803.416666666664 | 34.47 |
| 44803.427083333336 | 34.48 |
| 44803.4375 | 34.48 |
| 44803.447916666664 | 34.47 |
| 44803.458333333336 | 34.46 |
| 44803.46875 | 34.45 |
| 44803.479166666664 | 34.42 |
| 44803.489583333336 | 34.41 |
| 44803.5 | 34.4 |
| 44803.510416666664 | 34.4 |
| 44803.520833333336 | 34.39 |
| 44803.53125 | 34.4 |
| 44803.541666666664 | 34.41 |
| 44803.552083333336 | 34.42 |
| 44803.5625 | 34.41 |
| 44803.572916666664 | 34.4 |
| 44803.583333333336 | 34.41 |
| 44803.59375 | 34.37 |
| 44803.604166666664 | 34.3 |
| 44803.614583333336 | 34.27 |
| 44803.625 | 34.25 |
| 44803.635416666664 | 34.18 |
| 44803.645833333336 | 34.16 |
| 44803.65625 | 34.15 |
| 44803.666666666664 | 34.14 |
| 44803.677083333336 | 34.24 |
| 44803.6875 | 34.19 |
| 44803.697916666664 | 34.37 |
| 44803.708333333336 | 34.42 |
| 44803.71875 | 34.43 |
| 44803.729166666664 | 34.47 |
| 44803.739583333336 | 34.51 |
| 44803.75 | 34.52 |
| 44803.760416666664 | 34.56 |
| 44803.770833333336 | 34.53 |
| 44803.78125 | 34.47 |
| 44803.791666666664 | 34.46 |
| 44803.802083333336 | 34.45 |
| 44803.8125 | 34.49 |
| 44803.822916666664 | 34.52 |
| 44803.833333333336 | 34.54 |
| 44803.84375 | 34.56 |
| 44803.854166666664 | 34.55 |
| 44803.864583333336 | 34.55 |
| 44803.875 | 34.56 |
| 44803.885416666664 | 34.57 |
| 44803.895833333336 | 34.56 |
| 44803.90625 | 34.55 |
| 44803.916666666664 | 34.53 |
| 44803.927083333336 | 34.52 |
| 44803.9375 | 34.51 |
| 44803.947916666664 | 34.5 |
| 44803.958333333336 | 34.52 |
| 44803.96875 | 34.51 |
| 44803.979166666664 | 34.49 |
| 44803.989583333336 | 34.49 |
| 44804.0 | 34.5 |
| 44804.010416666664 | 34.51 |
| 44804.020833333336 | 34.54 |
| 44804.03125 | 34.56 |
| 44804.041666666664 | 34.58 |
| 44804.052083333336 | 34.57 |
| 44804.0625 | 34.6 |
| 44804.072916666664 | 34.63 |
| 44804.083333333336 | 34.64 |
| 44804.09375 | 34.66 |
| 44804.104166666664 | 34.68 |
| 44804.114583333336 | 34.66 |
| 44804.125 | 34.64 |
| 44804.135416666664 | 34.6 |
| 44804.145833333336 | 34.56 |
| 44804.15625 | 34.55 |
| 44804.166666666664 | 34.59 |
| 44804.177083333336 | 34.56 |
| 44804.1875 | 34.51 |
| 44804.197916666664 | 34.53 |
| 44804.208333333336 | 34.55 |
| 44804.21875 | 34.56 |
| 44804.229166666664 | 34.56 |
| 44804.239583333336 | 34.56 |
| 44804.25 | 34.53 |
| 44804.260416666664 | 34.55 |
| 44804.270833333336 | 34.55 |
| 44804.28125 | 34.39 |
| 44804.291666666664 | 34.36 |
| 44804.302083333336 | 34.36 |
| 44804.3125 | 34.4 |
| 44804.322916666664 | 34.38 |
| 44804.333333333336 | 34.38 |
| 44804.34375 | 34.4 |
| 44804.354166666664 | 34.4 |
| 44804.364583333336 | 34.41 |
| 44804.375 | 34.42 |
| 44804.385416666664 | 34.42 |
| 44804.395833333336 | 34.41 |
| 44804.40625 | 34.41 |
| 44804.416666666664 | 34.4 |
| 44804.427083333336 | 34.41 |
| 44804.4375 | 34.42 |
| 44804.447916666664 | 34.42 |
| 44804.458333333336 | 34.41 |
| 44804.46875 | 34.41 |
| 44804.479166666664 | 34.43 |
| 44804.489583333336 | 34.44 |
| 44804.5 | 34.46 |
| 44804.510416666664 | 34.47 |
| 44804.520833333336 | 34.47 |
| 44804.53125 | 34.47 |
| 44804.541666666664 | 34.47 |
| 44804.552083333336 | 34.48 |
| 44804.5625 | 34.5 |
| 44804.572916666664 | 34.53 |
| 44804.583333333336 | 34.56 |
| 44804.59375 | 34.56 |
| 44804.604166666664 | 34.52 |
| 44804.614583333336 | 34.47 |
| 44804.625 | 34.41 |
| 44804.635416666664 | 34.37 |
| 44804.645833333336 | 34.3 |
| 44804.65625 | 34.28 |
| 44804.666666666664 | 34.24 |
| 44804.677083333336 | 34.24 |
| 44804.6875 | 34.25 |
| 44804.697916666664 | 34.34 |
| 44804.708333333336 | 34.32 |
| 44804.71875 | 34.36 |
| 44804.729166666664 | 34.42 |
| 44804.739583333336 | 34.48 |
| 44804.75 | 34.5 |
| 44804.760416666664 | 34.52 |
| 44804.770833333336 | 34.52 |
| 44804.78125 | 34.55 |
| 44804.791666666664 | 34.59 |
| 44804.802083333336 | 34.65 |
| 44804.8125 | 34.6 |
| 44804.822916666664 | 34.54 |
| 44804.833333333336 | 34.56 |
| 44804.84375 | 34.52 |
| 44804.854166666664 | 34.53 |
| 44804.864583333336 | 34.55 |
| 44804.875 | 34.54 |
| 44804.885416666664 | 34.54 |
| 44804.895833333336 | 34.55 |
| 44804.90625 | 34.53 |
| 44804.916666666664 | 34.54 |
| 44804.927083333336 | 34.53 |
| 44804.9375 | 34.52 |
| 44804.947916666664 | 34.53 |
| 44804.958333333336 | 34.5 |
| 44804.96875 | 34.5 |
| 44804.979166666664 | 34.5 |
| 44804.989583333336 | 34.5 |
| 44805.0 | 34.51 |
| 44805.010416666664 | 34.51 |
| 44805.020833333336 | 34.49 |
| 44805.03125 | 34.46 |
| 44805.041666666664 | 34.45 |
| 44805.052083333336 | 34.44 |
| 44805.0625 | 34.46 |
| 44805.072916666664 | 34.46 |
| 44805.083333333336 | 34.46 |
| 44805.09375 | 34.48 |
| 44805.104166666664 | 34.5 |
| 44805.114583333336 | 34.51 |
| 44805.125 | 34.51 |
| 44805.135416666664 | 34.5 |
| 44805.145833333336 | 34.47 |